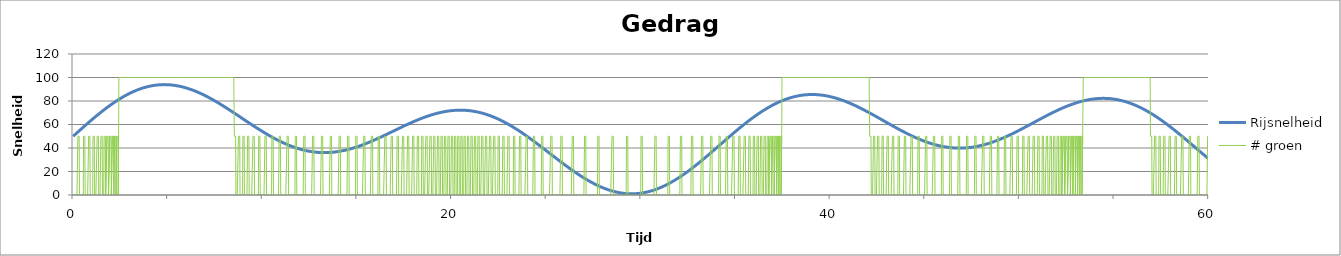
| Category | Rijsnelheid | # groen |
|---|---|---|
| 0.0 | 50 | 0 |
| 0.0 | 50.241 | 0 |
| 0.0 | 50.483 | 0 |
| 0.0 | 50.724 | 0 |
| 0.0 | 50.966 | 0 |
| 0.0 | 51.207 | 0 |
| 0.0 | 51.448 | 0 |
| 0.0 | 51.689 | 0 |
| 0.0 | 51.931 | 0 |
| 0.0 | 52.172 | 0 |
| 0.0 | 52.413 | 0 |
| 0.0 | 52.654 | 0 |
| 0.0 | 52.895 | 0 |
| 0.0 | 53.136 | 0 |
| 0.0 | 53.376 | 0 |
| 0.0 | 53.617 | 50 |
| 0.0 | 53.857 | 50 |
| 0.0 | 54.098 | 50 |
| 0.0 | 54.338 | 50 |
| 0.0 | 54.578 | 50 |
| 0.0 | 54.818 | 0 |
| 0.0 | 55.058 | 0 |
| 0.0 | 55.298 | 0 |
| 0.0 | 55.537 | 0 |
| 0.0 | 55.777 | 0 |
| 0.0 | 56.016 | 0 |
| 0.0 | 56.255 | 0 |
| 0.0 | 56.493 | 0 |
| 0.0 | 56.732 | 0 |
| 0.0 | 56.97 | 0 |
| 0.0 | 57.209 | 0 |
| 0.0 | 57.447 | 0 |
| 0.0 | 57.684 | 0 |
| 0.0 | 57.922 | 50 |
| 0.0 | 58.159 | 50 |
| 0.0 | 58.396 | 50 |
| 0.0 | 58.633 | 50 |
| 0.0 | 58.869 | 50 |
| 0.0 | 59.105 | 0 |
| 0.0 | 59.341 | 0 |
| 0.0 | 59.577 | 0 |
| 0.0 | 59.812 | 0 |
| 0.0 | 60.047 | 0 |
| 0.0 | 60.282 | 0 |
| 0.0 | 60.516 | 0 |
| 0.0 | 60.75 | 0 |
| 0.0 | 60.984 | 0 |
| 0.0 | 61.217 | 0 |
| 0.0 | 61.45 | 0 |
| 0.0 | 61.683 | 50 |
| 0.0 | 61.915 | 50 |
| 0.0 | 62.147 | 50 |
| 0.0 | 62.379 | 50 |
| 0.0 | 62.61 | 50 |
| 0.0 | 62.841 | 0 |
| 0.0 | 63.071 | 0 |
| 0.0 | 63.301 | 0 |
| 0.0 | 63.531 | 0 |
| 0.0 | 63.76 | 0 |
| 0.0 | 63.989 | 0 |
| 1.0 | 64.217 | 0 |
| 1.0 | 64.445 | 0 |
| 1.0 | 64.673 | 0 |
| 1.0 | 64.9 | 50 |
| 1.0 | 65.126 | 50 |
| 1.0 | 65.352 | 50 |
| 1.0 | 65.578 | 50 |
| 1.0 | 65.803 | 50 |
| 1.0 | 66.028 | 0 |
| 1.0 | 66.252 | 0 |
| 1.0 | 66.475 | 0 |
| 1.0 | 66.698 | 0 |
| 1.0 | 66.921 | 0 |
| 1.0 | 67.143 | 0 |
| 1.0 | 67.365 | 0 |
| 1.0 | 67.586 | 0 |
| 1.0 | 67.806 | 50 |
| 1.0 | 68.026 | 50 |
| 1.0 | 68.246 | 50 |
| 1.0 | 68.464 | 50 |
| 1.0 | 68.683 | 50 |
| 1.0 | 68.9 | 0 |
| 1.0 | 69.117 | 0 |
| 1.0 | 69.334 | 0 |
| 1.0 | 69.55 | 0 |
| 1.0 | 69.765 | 0 |
| 1.0 | 69.98 | 0 |
| 1.0 | 70.194 | 0 |
| 1.0 | 70.407 | 50 |
| 1.0 | 70.62 | 50 |
| 1.0 | 70.833 | 50 |
| 1.0 | 71.044 | 50 |
| 1.0 | 71.255 | 50 |
| 1.0 | 71.465 | 0 |
| 1.0 | 71.675 | 0 |
| 1.0 | 71.884 | 0 |
| 1.0 | 72.092 | 0 |
| 1.0 | 72.3 | 0 |
| 1.0 | 72.507 | 50 |
| 1.0 | 72.713 | 50 |
| 1.0 | 72.918 | 50 |
| 1.0 | 73.123 | 50 |
| 1.0 | 73.327 | 50 |
| 1.0 | 73.531 | 0 |
| 1.0 | 73.734 | 0 |
| 1.0 | 73.935 | 0 |
| 1.0 | 74.137 | 0 |
| 1.0 | 74.337 | 50 |
| 1.0 | 74.537 | 50 |
| 1.0 | 74.736 | 50 |
| 1.0 | 74.934 | 50 |
| 1.0 | 75.132 | 50 |
| 1.0 | 75.328 | 0 |
| 1.0 | 75.524 | 0 |
| 1.0 | 75.719 | 0 |
| 1.0 | 75.914 | 0 |
| 1.0 | 76.107 | 50 |
| 1.0 | 76.3 | 50 |
| 1.0 | 76.492 | 50 |
| 1.0 | 76.683 | 50 |
| 2.0 | 76.874 | 50 |
| 2.0 | 77.063 | 0 |
| 2.0 | 77.252 | 0 |
| 2.0 | 77.44 | 0 |
| 2.0 | 77.627 | 50 |
| 2.0 | 77.813 | 50 |
| 2.0 | 77.998 | 50 |
| 2.0 | 78.183 | 50 |
| 2.0 | 78.366 | 50 |
| 2.0 | 78.549 | 0 |
| 2.0 | 78.731 | 0 |
| 2.0 | 78.912 | 50 |
| 2.0 | 79.092 | 50 |
| 2.0 | 79.272 | 50 |
| 2.0 | 79.45 | 50 |
| 2.0 | 79.627 | 50 |
| 2.0 | 79.804 | 0 |
| 2.0 | 79.98 | 0 |
| 2.0 | 80.154 | 50 |
| 2.0 | 80.328 | 50 |
| 2.0 | 80.501 | 50 |
| 2.0 | 80.673 | 50 |
| 2.0 | 80.844 | 50 |
| 2.0 | 81.014 | 0 |
| 2.0 | 81.183 | 50 |
| 2.0 | 81.352 | 100 |
| 2.0 | 81.519 | 100 |
| 2.0 | 81.685 | 100 |
| 2.0 | 81.851 | 100 |
| 2.0 | 82.015 | 100 |
| 2.0 | 82.179 | 100 |
| 2.0 | 82.341 | 100 |
| 2.0 | 82.502 | 100 |
| 2.0 | 82.663 | 100 |
| 2.0 | 82.822 | 100 |
| 2.0 | 82.981 | 100 |
| 2.0 | 83.139 | 100 |
| 2.0 | 83.295 | 100 |
| 2.0 | 83.451 | 100 |
| 2.0 | 83.605 | 100 |
| 2.0 | 83.759 | 100 |
| 2.0 | 83.911 | 100 |
| 2.0 | 84.062 | 100 |
| 2.0 | 84.213 | 100 |
| 2.0 | 84.362 | 100 |
| 2.0 | 84.511 | 100 |
| 2.0 | 84.658 | 100 |
| 2.0 | 84.804 | 100 |
| 2.0 | 84.949 | 100 |
| 2.0 | 85.094 | 100 |
| 2.0 | 85.237 | 100 |
| 2.0 | 85.379 | 100 |
| 2.0 | 85.52 | 100 |
| 2.0 | 85.66 | 100 |
| 2.0 | 85.798 | 100 |
| 2.0 | 85.936 | 100 |
| 2.0 | 86.073 | 100 |
| 2.0 | 86.209 | 100 |
| 2.0 | 86.343 | 100 |
| 2.0 | 86.476 | 100 |
| 3.0 | 86.609 | 100 |
| 3.0 | 86.74 | 100 |
| 3.0 | 86.87 | 100 |
| 3.0 | 86.999 | 100 |
| 3.0 | 87.127 | 100 |
| 3.0 | 87.254 | 100 |
| 3.0 | 87.38 | 100 |
| 3.0 | 87.504 | 100 |
| 3.0 | 87.628 | 100 |
| 3.0 | 87.75 | 100 |
| 3.0 | 87.871 | 100 |
| 3.0 | 87.991 | 100 |
| 3.0 | 88.11 | 100 |
| 3.0 | 88.228 | 100 |
| 3.0 | 88.345 | 100 |
| 3.0 | 88.46 | 100 |
| 3.0 | 88.575 | 100 |
| 3.0 | 88.688 | 100 |
| 3.0 | 88.8 | 100 |
| 3.0 | 88.911 | 100 |
| 3.0 | 89.021 | 100 |
| 3.0 | 89.129 | 100 |
| 3.0 | 89.237 | 100 |
| 3.0 | 89.343 | 100 |
| 3.0 | 89.448 | 100 |
| 3.0 | 89.552 | 100 |
| 3.0 | 89.655 | 100 |
| 3.0 | 89.757 | 100 |
| 3.0 | 89.857 | 100 |
| 3.0 | 89.956 | 100 |
| 3.0 | 90.054 | 100 |
| 3.0 | 90.151 | 100 |
| 3.0 | 90.247 | 100 |
| 3.0 | 90.341 | 100 |
| 3.0 | 90.435 | 100 |
| 3.0 | 90.527 | 100 |
| 3.0 | 90.618 | 100 |
| 3.0 | 90.707 | 100 |
| 3.0 | 90.796 | 100 |
| 3.0 | 90.883 | 100 |
| 3.0 | 90.969 | 100 |
| 3.0 | 91.054 | 100 |
| 3.0 | 91.138 | 100 |
| 3.0 | 91.22 | 100 |
| 3.0 | 91.302 | 100 |
| 3.0 | 91.382 | 100 |
| 3.0 | 91.461 | 100 |
| 3.0 | 91.538 | 100 |
| 3.0 | 91.615 | 100 |
| 3.0 | 91.69 | 100 |
| 3.0 | 91.764 | 100 |
| 3.0 | 91.837 | 100 |
| 3.0 | 91.908 | 100 |
| 3.0 | 91.979 | 100 |
| 3.0 | 92.048 | 100 |
| 3.0 | 92.116 | 100 |
| 3.0 | 92.182 | 100 |
| 3.0 | 92.248 | 100 |
| 3.0 | 92.312 | 100 |
| 3.0 | 92.375 | 100 |
| 4.0 | 92.436 | 100 |
| 4.0 | 92.497 | 100 |
| 4.0 | 92.556 | 100 |
| 4.0 | 92.614 | 100 |
| 4.0 | 92.671 | 100 |
| 4.0 | 92.726 | 100 |
| 4.0 | 92.781 | 100 |
| 4.0 | 92.834 | 100 |
| 4.0 | 92.886 | 100 |
| 4.0 | 92.936 | 100 |
| 4.0 | 92.985 | 100 |
| 4.0 | 93.034 | 100 |
| 4.0 | 93.08 | 100 |
| 4.0 | 93.126 | 100 |
| 4.0 | 93.17 | 100 |
| 4.0 | 93.213 | 100 |
| 4.0 | 93.255 | 100 |
| 4.0 | 93.296 | 100 |
| 4.0 | 93.335 | 100 |
| 4.0 | 93.374 | 100 |
| 4.0 | 93.41 | 100 |
| 4.0 | 93.446 | 100 |
| 4.0 | 93.48 | 100 |
| 4.0 | 93.514 | 100 |
| 4.0 | 93.546 | 100 |
| 4.0 | 93.576 | 100 |
| 4.0 | 93.606 | 100 |
| 4.0 | 93.634 | 100 |
| 4.0 | 93.661 | 100 |
| 4.0 | 93.686 | 100 |
| 4.0 | 93.711 | 100 |
| 4.0 | 93.734 | 100 |
| 4.0 | 93.756 | 100 |
| 4.0 | 93.777 | 100 |
| 4.0 | 93.796 | 100 |
| 4.0 | 93.814 | 100 |
| 4.0 | 93.831 | 100 |
| 4.0 | 93.847 | 100 |
| 4.0 | 93.862 | 100 |
| 4.0 | 93.875 | 100 |
| 4.0 | 93.887 | 100 |
| 4.0 | 93.898 | 100 |
| 4.0 | 93.907 | 100 |
| 4.0 | 93.915 | 100 |
| 4.0 | 93.922 | 100 |
| 4.0 | 93.928 | 100 |
| 4.0 | 93.933 | 100 |
| 4.0 | 93.936 | 100 |
| 4.0 | 93.938 | 100 |
| 4.0 | 93.939 | 100 |
| 4.0 | 93.939 | 100 |
| 4.0 | 93.937 | 100 |
| 4.0 | 93.935 | 100 |
| 4.0 | 93.931 | 100 |
| 4.0 | 93.925 | 100 |
| 4.0 | 93.919 | 100 |
| 4.0 | 93.911 | 100 |
| 4.0 | 93.902 | 100 |
| 4.0 | 93.892 | 100 |
| 4.0 | 93.881 | 100 |
| 5.0 | 93.868 | 100 |
| 5.0 | 93.854 | 100 |
| 5.0 | 93.839 | 100 |
| 5.0 | 93.823 | 100 |
| 5.0 | 93.806 | 100 |
| 5.0 | 93.787 | 100 |
| 5.0 | 93.767 | 100 |
| 5.0 | 93.746 | 100 |
| 5.0 | 93.724 | 100 |
| 5.0 | 93.701 | 100 |
| 5.0 | 93.676 | 100 |
| 5.0 | 93.65 | 100 |
| 5.0 | 93.623 | 100 |
| 5.0 | 93.595 | 100 |
| 5.0 | 93.565 | 100 |
| 5.0 | 93.535 | 100 |
| 5.0 | 93.503 | 100 |
| 5.0 | 93.47 | 100 |
| 5.0 | 93.436 | 100 |
| 5.0 | 93.401 | 100 |
| 5.0 | 93.364 | 100 |
| 5.0 | 93.326 | 100 |
| 5.0 | 93.288 | 100 |
| 5.0 | 93.248 | 100 |
| 5.0 | 93.206 | 100 |
| 5.0 | 93.164 | 100 |
| 5.0 | 93.12 | 100 |
| 5.0 | 93.076 | 100 |
| 5.0 | 93.03 | 100 |
| 5.0 | 92.983 | 100 |
| 5.0 | 92.935 | 100 |
| 5.0 | 92.886 | 100 |
| 5.0 | 92.835 | 100 |
| 5.0 | 92.784 | 100 |
| 5.0 | 92.731 | 100 |
| 5.0 | 92.677 | 100 |
| 5.0 | 92.622 | 100 |
| 5.0 | 92.566 | 100 |
| 5.0 | 92.509 | 100 |
| 5.0 | 92.45 | 100 |
| 5.0 | 92.391 | 100 |
| 5.0 | 92.33 | 100 |
| 5.0 | 92.268 | 100 |
| 5.0 | 92.206 | 100 |
| 5.0 | 92.142 | 100 |
| 5.0 | 92.077 | 100 |
| 5.0 | 92.011 | 100 |
| 5.0 | 91.943 | 100 |
| 5.0 | 91.875 | 100 |
| 5.0 | 91.806 | 100 |
| 5.0 | 91.735 | 100 |
| 5.0 | 91.664 | 100 |
| 5.0 | 91.591 | 100 |
| 5.0 | 91.517 | 100 |
| 5.0 | 91.442 | 100 |
| 5.0 | 91.366 | 100 |
| 5.0 | 91.289 | 100 |
| 5.0 | 91.211 | 100 |
| 5.0 | 91.132 | 100 |
| 5.0 | 91.052 | 100 |
| 6.0 | 90.971 | 100 |
| 6.0 | 90.889 | 100 |
| 6.0 | 90.806 | 100 |
| 6.0 | 90.721 | 100 |
| 6.0 | 90.636 | 100 |
| 6.0 | 90.55 | 100 |
| 6.0 | 90.462 | 100 |
| 6.0 | 90.374 | 100 |
| 6.0 | 90.285 | 100 |
| 6.0 | 90.194 | 100 |
| 6.0 | 90.103 | 100 |
| 6.0 | 90.01 | 100 |
| 6.0 | 89.917 | 100 |
| 6.0 | 89.822 | 100 |
| 6.0 | 89.727 | 100 |
| 6.0 | 89.631 | 100 |
| 6.0 | 89.533 | 100 |
| 6.0 | 89.435 | 100 |
| 6.0 | 89.335 | 100 |
| 6.0 | 89.235 | 100 |
| 6.0 | 89.134 | 100 |
| 6.0 | 89.032 | 100 |
| 6.0 | 88.929 | 100 |
| 6.0 | 88.824 | 100 |
| 6.0 | 88.719 | 100 |
| 6.0 | 88.613 | 100 |
| 6.0 | 88.506 | 100 |
| 6.0 | 88.399 | 100 |
| 6.0 | 88.29 | 100 |
| 6.0 | 88.18 | 100 |
| 6.0 | 88.069 | 100 |
| 6.0 | 87.958 | 100 |
| 6.0 | 87.845 | 100 |
| 6.0 | 87.732 | 100 |
| 6.0 | 87.618 | 100 |
| 6.0 | 87.503 | 100 |
| 6.0 | 87.387 | 100 |
| 6.0 | 87.27 | 100 |
| 6.0 | 87.152 | 100 |
| 6.0 | 87.033 | 100 |
| 6.0 | 86.914 | 100 |
| 6.0 | 86.794 | 100 |
| 6.0 | 86.672 | 100 |
| 6.0 | 86.55 | 100 |
| 6.0 | 86.427 | 100 |
| 6.0 | 86.304 | 100 |
| 6.0 | 86.179 | 100 |
| 6.0 | 86.054 | 100 |
| 6.0 | 85.927 | 100 |
| 6.0 | 85.8 | 100 |
| 6.0 | 85.673 | 100 |
| 6.0 | 85.544 | 100 |
| 6.0 | 85.414 | 100 |
| 6.0 | 85.284 | 100 |
| 6.0 | 85.153 | 100 |
| 6.0 | 85.021 | 100 |
| 6.0 | 84.889 | 100 |
| 6.0 | 84.755 | 100 |
| 6.0 | 84.621 | 100 |
| 6.0 | 84.486 | 100 |
| 7.0 | 84.351 | 100 |
| 7.0 | 84.214 | 100 |
| 7.0 | 84.077 | 100 |
| 7.0 | 83.939 | 100 |
| 7.0 | 83.801 | 100 |
| 7.0 | 83.661 | 100 |
| 7.0 | 83.521 | 100 |
| 7.0 | 83.381 | 100 |
| 7.0 | 83.239 | 100 |
| 7.0 | 83.097 | 100 |
| 7.0 | 82.954 | 100 |
| 7.0 | 82.811 | 100 |
| 7.0 | 82.666 | 100 |
| 7.0 | 82.522 | 100 |
| 7.0 | 82.376 | 100 |
| 7.0 | 82.23 | 100 |
| 7.0 | 82.083 | 100 |
| 7.0 | 81.935 | 100 |
| 7.0 | 81.787 | 100 |
| 7.0 | 81.638 | 100 |
| 7.0 | 81.489 | 100 |
| 7.0 | 81.339 | 100 |
| 7.0 | 81.188 | 100 |
| 7.0 | 81.037 | 100 |
| 7.0 | 80.885 | 100 |
| 7.0 | 80.732 | 100 |
| 7.0 | 80.579 | 100 |
| 7.0 | 80.425 | 100 |
| 7.0 | 80.271 | 100 |
| 7.0 | 80.116 | 100 |
| 7.0 | 79.961 | 100 |
| 7.0 | 79.805 | 100 |
| 7.0 | 79.648 | 100 |
| 7.0 | 79.491 | 100 |
| 7.0 | 79.333 | 100 |
| 7.0 | 79.175 | 100 |
| 7.0 | 79.016 | 100 |
| 7.0 | 78.857 | 100 |
| 7.0 | 78.697 | 100 |
| 7.0 | 78.537 | 100 |
| 7.0 | 78.376 | 100 |
| 7.0 | 78.215 | 100 |
| 7.0 | 78.053 | 100 |
| 7.0 | 77.891 | 100 |
| 7.0 | 77.728 | 100 |
| 7.0 | 77.565 | 100 |
| 7.0 | 77.401 | 100 |
| 7.0 | 77.237 | 100 |
| 7.0 | 77.072 | 100 |
| 7.0 | 76.907 | 100 |
| 7.0 | 76.741 | 100 |
| 7.0 | 76.575 | 100 |
| 7.0 | 76.409 | 100 |
| 7.0 | 76.242 | 100 |
| 7.0 | 76.075 | 100 |
| 7.0 | 75.908 | 100 |
| 7.0 | 75.74 | 100 |
| 7.0 | 75.571 | 100 |
| 7.0 | 75.402 | 100 |
| 7.0 | 75.233 | 100 |
| 8.0 | 75.064 | 100 |
| 8.0 | 74.894 | 100 |
| 8.0 | 74.723 | 100 |
| 8.0 | 74.553 | 100 |
| 8.0 | 74.382 | 100 |
| 8.0 | 74.211 | 100 |
| 8.0 | 74.039 | 100 |
| 8.0 | 73.867 | 100 |
| 8.0 | 73.695 | 100 |
| 8.0 | 73.522 | 100 |
| 8.0 | 73.349 | 100 |
| 8.0 | 73.176 | 100 |
| 8.0 | 73.002 | 100 |
| 8.0 | 72.829 | 100 |
| 8.0 | 72.655 | 100 |
| 8.0 | 72.48 | 100 |
| 8.0 | 72.306 | 100 |
| 8.0 | 72.131 | 100 |
| 8.0 | 71.956 | 100 |
| 8.0 | 71.781 | 100 |
| 8.0 | 71.605 | 100 |
| 8.0 | 71.429 | 100 |
| 8.0 | 71.253 | 100 |
| 8.0 | 71.077 | 100 |
| 8.0 | 70.901 | 100 |
| 8.0 | 70.724 | 100 |
| 8.0 | 70.547 | 100 |
| 8.0 | 70.37 | 100 |
| 8.0 | 70.193 | 100 |
| 8.0 | 70.016 | 100 |
| 8.0 | 69.838 | 100 |
| 8.0 | 69.66 | 50 |
| 8.0 | 69.482 | 50 |
| 8.0 | 69.304 | 50 |
| 8.0 | 69.126 | 50 |
| 8.0 | 68.948 | 50 |
| 8.0 | 68.77 | 0 |
| 8.0 | 68.591 | 0 |
| 8.0 | 68.413 | 0 |
| 8.0 | 68.234 | 0 |
| 8.0 | 68.055 | 0 |
| 8.0 | 67.876 | 0 |
| 8.0 | 67.697 | 0 |
| 8.0 | 67.518 | 0 |
| 8.0 | 67.339 | 50 |
| 8.0 | 67.16 | 50 |
| 8.0 | 66.981 | 50 |
| 8.0 | 66.801 | 50 |
| 8.0 | 66.622 | 50 |
| 8.0 | 66.443 | 0 |
| 8.0 | 66.263 | 0 |
| 8.0 | 66.084 | 0 |
| 8.0 | 65.904 | 0 |
| 8.0 | 65.725 | 0 |
| 8.0 | 65.546 | 0 |
| 8.0 | 65.366 | 0 |
| 8.0 | 65.187 | 0 |
| 8.0 | 65.007 | 0 |
| 8.0 | 64.828 | 50 |
| 8.0 | 64.649 | 50 |
| 9.0 | 64.469 | 50 |
| 9.0 | 64.29 | 50 |
| 9.0 | 64.111 | 50 |
| 9.0 | 63.932 | 0 |
| 9.0 | 63.753 | 0 |
| 9.0 | 63.574 | 0 |
| 9.0 | 63.395 | 0 |
| 9.0 | 63.216 | 0 |
| 9.0 | 63.038 | 0 |
| 9.0 | 62.859 | 0 |
| 9.0 | 62.681 | 0 |
| 9.0 | 62.502 | 0 |
| 9.0 | 62.324 | 0 |
| 9.0 | 62.146 | 50 |
| 9.0 | 61.968 | 50 |
| 9.0 | 61.79 | 50 |
| 9.0 | 61.612 | 50 |
| 9.0 | 61.435 | 50 |
| 9.0 | 61.258 | 0 |
| 9.0 | 61.08 | 0 |
| 9.0 | 60.903 | 0 |
| 9.0 | 60.727 | 0 |
| 9.0 | 60.55 | 0 |
| 9.0 | 60.374 | 0 |
| 9.0 | 60.197 | 0 |
| 9.0 | 60.021 | 0 |
| 9.0 | 59.846 | 0 |
| 9.0 | 59.67 | 0 |
| 9.0 | 59.495 | 0 |
| 9.0 | 59.32 | 0 |
| 9.0 | 59.145 | 50 |
| 9.0 | 58.97 | 50 |
| 9.0 | 58.796 | 50 |
| 9.0 | 58.622 | 50 |
| 9.0 | 58.448 | 50 |
| 9.0 | 58.274 | 0 |
| 9.0 | 58.101 | 0 |
| 9.0 | 57.928 | 0 |
| 9.0 | 57.756 | 0 |
| 9.0 | 57.583 | 0 |
| 9.0 | 57.411 | 0 |
| 9.0 | 57.239 | 0 |
| 9.0 | 57.068 | 0 |
| 9.0 | 56.897 | 0 |
| 9.0 | 56.726 | 0 |
| 9.0 | 56.556 | 0 |
| 9.0 | 56.386 | 0 |
| 9.0 | 56.216 | 0 |
| 9.0 | 56.047 | 50 |
| 9.0 | 55.878 | 50 |
| 9.0 | 55.709 | 50 |
| 9.0 | 55.541 | 50 |
| 9.0 | 55.373 | 50 |
| 9.0 | 55.206 | 0 |
| 9.0 | 55.039 | 0 |
| 9.0 | 54.872 | 0 |
| 9.0 | 54.706 | 0 |
| 9.0 | 54.54 | 0 |
| 9.0 | 54.375 | 0 |
| 9.0 | 54.21 | 0 |
| 10.0 | 54.045 | 0 |
| 10.0 | 53.881 | 0 |
| 10.0 | 53.717 | 0 |
| 10.0 | 53.554 | 0 |
| 10.0 | 53.391 | 0 |
| 10.0 | 53.229 | 0 |
| 10.0 | 53.067 | 0 |
| 10.0 | 52.906 | 0 |
| 10.0 | 52.745 | 50 |
| 10.0 | 52.585 | 50 |
| 10.0 | 52.425 | 50 |
| 10.0 | 52.266 | 50 |
| 10.0 | 52.107 | 50 |
| 10.0 | 51.948 | 0 |
| 10.0 | 51.791 | 0 |
| 10.0 | 51.633 | 0 |
| 10.0 | 51.477 | 0 |
| 10.0 | 51.32 | 0 |
| 10.0 | 51.165 | 0 |
| 10.0 | 51.009 | 0 |
| 10.0 | 50.855 | 0 |
| 10.0 | 50.701 | 0 |
| 10.0 | 50.547 | 0 |
| 10.0 | 50.394 | 0 |
| 10.0 | 50.242 | 0 |
| 10.0 | 50.09 | 0 |
| 10.0 | 49.939 | 0 |
| 10.0 | 49.788 | 0 |
| 10.0 | 49.638 | 0 |
| 10.0 | 49.489 | 0 |
| 10.0 | 49.34 | 50 |
| 10.0 | 49.192 | 50 |
| 10.0 | 49.044 | 50 |
| 10.0 | 48.898 | 50 |
| 10.0 | 48.751 | 50 |
| 10.0 | 48.606 | 0 |
| 10.0 | 48.46 | 0 |
| 10.0 | 48.316 | 0 |
| 10.0 | 48.172 | 0 |
| 10.0 | 48.029 | 0 |
| 10.0 | 47.887 | 0 |
| 10.0 | 47.745 | 0 |
| 10.0 | 47.604 | 0 |
| 10.0 | 47.463 | 0 |
| 10.0 | 47.323 | 0 |
| 10.0 | 47.184 | 0 |
| 10.0 | 47.046 | 0 |
| 10.0 | 46.908 | 0 |
| 10.0 | 46.771 | 0 |
| 10.0 | 46.635 | 0 |
| 10.0 | 46.499 | 0 |
| 10.0 | 46.364 | 0 |
| 10.0 | 46.23 | 0 |
| 10.0 | 46.097 | 50 |
| 10.0 | 45.964 | 50 |
| 10.0 | 45.832 | 50 |
| 10.0 | 45.701 | 50 |
| 10.0 | 45.57 | 50 |
| 10.0 | 45.44 | 0 |
| 10.0 | 45.311 | 0 |
| 11.0 | 45.183 | 0 |
| 11.0 | 45.055 | 0 |
| 11.0 | 44.928 | 0 |
| 11.0 | 44.802 | 0 |
| 11.0 | 44.677 | 0 |
| 11.0 | 44.553 | 0 |
| 11.0 | 44.429 | 0 |
| 11.0 | 44.306 | 0 |
| 11.0 | 44.184 | 0 |
| 11.0 | 44.062 | 0 |
| 11.0 | 43.942 | 0 |
| 11.0 | 43.822 | 0 |
| 11.0 | 43.703 | 0 |
| 11.0 | 43.585 | 0 |
| 11.0 | 43.468 | 0 |
| 11.0 | 43.351 | 0 |
| 11.0 | 43.235 | 0 |
| 11.0 | 43.12 | 0 |
| 11.0 | 43.006 | 50 |
| 11.0 | 42.893 | 50 |
| 11.0 | 42.781 | 50 |
| 11.0 | 42.669 | 50 |
| 11.0 | 42.558 | 50 |
| 11.0 | 42.448 | 0 |
| 11.0 | 42.339 | 0 |
| 11.0 | 42.231 | 0 |
| 11.0 | 42.124 | 0 |
| 11.0 | 42.017 | 0 |
| 11.0 | 41.912 | 0 |
| 11.0 | 41.807 | 0 |
| 11.0 | 41.703 | 0 |
| 11.0 | 41.6 | 0 |
| 11.0 | 41.498 | 0 |
| 11.0 | 41.396 | 0 |
| 11.0 | 41.296 | 0 |
| 11.0 | 41.196 | 0 |
| 11.0 | 41.098 | 0 |
| 11.0 | 41 | 0 |
| 11.0 | 40.903 | 0 |
| 11.0 | 40.807 | 0 |
| 11.0 | 40.712 | 0 |
| 11.0 | 40.618 | 0 |
| 11.0 | 40.525 | 0 |
| 11.0 | 40.432 | 0 |
| 11.0 | 40.341 | 50 |
| 11.0 | 40.25 | 50 |
| 11.0 | 40.161 | 50 |
| 11.0 | 40.072 | 50 |
| 11.0 | 39.984 | 50 |
| 11.0 | 39.897 | 0 |
| 11.0 | 39.812 | 0 |
| 11.0 | 39.727 | 0 |
| 11.0 | 39.642 | 0 |
| 11.0 | 39.559 | 0 |
| 11.0 | 39.477 | 0 |
| 11.0 | 39.396 | 0 |
| 11.0 | 39.316 | 0 |
| 11.0 | 39.236 | 0 |
| 11.0 | 39.158 | 0 |
| 11.0 | 39.08 | 0 |
| 12.0 | 39.004 | 0 |
| 12.0 | 38.928 | 0 |
| 12.0 | 38.854 | 0 |
| 12.0 | 38.78 | 0 |
| 12.0 | 38.707 | 0 |
| 12.0 | 38.635 | 0 |
| 12.0 | 38.565 | 0 |
| 12.0 | 38.495 | 0 |
| 12.0 | 38.426 | 0 |
| 12.0 | 38.358 | 0 |
| 12.0 | 38.291 | 0 |
| 12.0 | 38.225 | 50 |
| 12.0 | 38.16 | 50 |
| 12.0 | 38.096 | 50 |
| 12.0 | 38.033 | 50 |
| 12.0 | 37.971 | 50 |
| 12.0 | 37.91 | 0 |
| 12.0 | 37.85 | 0 |
| 12.0 | 37.791 | 0 |
| 12.0 | 37.733 | 0 |
| 12.0 | 37.676 | 0 |
| 12.0 | 37.619 | 0 |
| 12.0 | 37.564 | 0 |
| 12.0 | 37.51 | 0 |
| 12.0 | 37.457 | 0 |
| 12.0 | 37.405 | 0 |
| 12.0 | 37.353 | 0 |
| 12.0 | 37.303 | 0 |
| 12.0 | 37.254 | 0 |
| 12.0 | 37.206 | 0 |
| 12.0 | 37.159 | 0 |
| 12.0 | 37.112 | 0 |
| 12.0 | 37.067 | 0 |
| 12.0 | 37.023 | 0 |
| 12.0 | 36.98 | 0 |
| 12.0 | 36.937 | 0 |
| 12.0 | 36.896 | 0 |
| 12.0 | 36.856 | 0 |
| 12.0 | 36.817 | 0 |
| 12.0 | 36.778 | 50 |
| 12.0 | 36.741 | 50 |
| 12.0 | 36.705 | 50 |
| 12.0 | 36.67 | 50 |
| 12.0 | 36.636 | 50 |
| 12.0 | 36.602 | 0 |
| 12.0 | 36.57 | 0 |
| 12.0 | 36.539 | 0 |
| 12.0 | 36.509 | 0 |
| 12.0 | 36.48 | 0 |
| 12.0 | 36.451 | 0 |
| 12.0 | 36.424 | 0 |
| 12.0 | 36.398 | 0 |
| 12.0 | 36.373 | 0 |
| 12.0 | 36.349 | 0 |
| 12.0 | 36.326 | 0 |
| 12.0 | 36.304 | 0 |
| 12.0 | 36.282 | 0 |
| 12.0 | 36.262 | 0 |
| 12.0 | 36.243 | 0 |
| 12.0 | 36.225 | 0 |
| 13.0 | 36.208 | 0 |
| 13.0 | 36.192 | 0 |
| 13.0 | 36.177 | 0 |
| 13.0 | 36.163 | 0 |
| 13.0 | 36.15 | 0 |
| 13.0 | 36.137 | 0 |
| 13.0 | 36.126 | 0 |
| 13.0 | 36.116 | 50 |
| 13.0 | 36.107 | 50 |
| 13.0 | 36.099 | 50 |
| 13.0 | 36.092 | 50 |
| 13.0 | 36.086 | 50 |
| 13.0 | 36.081 | 0 |
| 13.0 | 36.077 | 0 |
| 13.0 | 36.074 | 0 |
| 13.0 | 36.072 | 0 |
| 13.0 | 36.07 | 0 |
| 13.0 | 36.07 | 0 |
| 13.0 | 36.071 | 0 |
| 13.0 | 36.073 | 0 |
| 13.0 | 36.076 | 0 |
| 13.0 | 36.08 | 0 |
| 13.0 | 36.085 | 0 |
| 13.0 | 36.09 | 0 |
| 13.0 | 36.097 | 0 |
| 13.0 | 36.105 | 0 |
| 13.0 | 36.114 | 0 |
| 13.0 | 36.124 | 0 |
| 13.0 | 36.134 | 0 |
| 13.0 | 36.146 | 0 |
| 13.0 | 36.159 | 0 |
| 13.0 | 36.172 | 0 |
| 13.0 | 36.187 | 0 |
| 13.0 | 36.203 | 0 |
| 13.0 | 36.219 | 0 |
| 13.0 | 36.237 | 50 |
| 13.0 | 36.255 | 50 |
| 13.0 | 36.275 | 50 |
| 13.0 | 36.295 | 50 |
| 13.0 | 36.317 | 50 |
| 13.0 | 36.339 | 0 |
| 13.0 | 36.362 | 0 |
| 13.0 | 36.386 | 0 |
| 13.0 | 36.412 | 0 |
| 13.0 | 36.438 | 0 |
| 13.0 | 36.465 | 0 |
| 13.0 | 36.493 | 0 |
| 13.0 | 36.522 | 0 |
| 13.0 | 36.552 | 0 |
| 13.0 | 36.583 | 0 |
| 13.0 | 36.615 | 0 |
| 13.0 | 36.647 | 0 |
| 13.0 | 36.681 | 0 |
| 13.0 | 36.716 | 0 |
| 13.0 | 36.751 | 0 |
| 13.0 | 36.788 | 0 |
| 13.0 | 36.825 | 0 |
| 13.0 | 36.863 | 0 |
| 13.0 | 36.903 | 0 |
| 13.0 | 36.943 | 0 |
| 14.0 | 36.984 | 0 |
| 14.0 | 37.026 | 0 |
| 14.0 | 37.069 | 0 |
| 14.0 | 37.112 | 50 |
| 14.0 | 37.157 | 50 |
| 14.0 | 37.203 | 50 |
| 14.0 | 37.249 | 50 |
| 14.0 | 37.297 | 50 |
| 14.0 | 37.345 | 0 |
| 14.0 | 37.394 | 0 |
| 14.0 | 37.444 | 0 |
| 14.0 | 37.495 | 0 |
| 14.0 | 37.546 | 0 |
| 14.0 | 37.599 | 0 |
| 14.0 | 37.653 | 0 |
| 14.0 | 37.707 | 0 |
| 14.0 | 37.762 | 0 |
| 14.0 | 37.818 | 0 |
| 14.0 | 37.875 | 0 |
| 14.0 | 37.933 | 0 |
| 14.0 | 37.992 | 0 |
| 14.0 | 38.051 | 0 |
| 14.0 | 38.111 | 0 |
| 14.0 | 38.173 | 0 |
| 14.0 | 38.235 | 0 |
| 14.0 | 38.297 | 0 |
| 14.0 | 38.361 | 0 |
| 14.0 | 38.426 | 0 |
| 14.0 | 38.491 | 0 |
| 14.0 | 38.557 | 0 |
| 14.0 | 38.624 | 50 |
| 14.0 | 38.692 | 50 |
| 14.0 | 38.76 | 50 |
| 14.0 | 38.829 | 50 |
| 14.0 | 38.9 | 50 |
| 14.0 | 38.971 | 0 |
| 14.0 | 39.042 | 0 |
| 14.0 | 39.115 | 0 |
| 14.0 | 39.188 | 0 |
| 14.0 | 39.262 | 0 |
| 14.0 | 39.337 | 0 |
| 14.0 | 39.412 | 0 |
| 14.0 | 39.489 | 0 |
| 14.0 | 39.566 | 0 |
| 14.0 | 39.644 | 0 |
| 14.0 | 39.722 | 0 |
| 14.0 | 39.802 | 0 |
| 14.0 | 39.882 | 0 |
| 14.0 | 39.963 | 0 |
| 14.0 | 40.044 | 0 |
| 14.0 | 40.127 | 0 |
| 14.0 | 40.21 | 0 |
| 14.0 | 40.293 | 0 |
| 14.0 | 40.378 | 0 |
| 14.0 | 40.463 | 0 |
| 14.0 | 40.549 | 0 |
| 14.0 | 40.635 | 50 |
| 14.0 | 40.723 | 50 |
| 14.0 | 40.811 | 50 |
| 14.0 | 40.899 | 50 |
| 15.0 | 40.989 | 50 |
| 15.0 | 41.079 | 0 |
| 15.0 | 41.169 | 0 |
| 15.0 | 41.261 | 0 |
| 15.0 | 41.353 | 0 |
| 15.0 | 41.445 | 0 |
| 15.0 | 41.539 | 0 |
| 15.0 | 41.633 | 0 |
| 15.0 | 41.727 | 0 |
| 15.0 | 41.822 | 0 |
| 15.0 | 41.918 | 0 |
| 15.0 | 42.015 | 0 |
| 15.0 | 42.112 | 0 |
| 15.0 | 42.21 | 0 |
| 15.0 | 42.308 | 0 |
| 15.0 | 42.407 | 0 |
| 15.0 | 42.507 | 0 |
| 15.0 | 42.607 | 0 |
| 15.0 | 42.708 | 0 |
| 15.0 | 42.809 | 0 |
| 15.0 | 42.911 | 0 |
| 15.0 | 43.013 | 50 |
| 15.0 | 43.116 | 50 |
| 15.0 | 43.22 | 50 |
| 15.0 | 43.324 | 50 |
| 15.0 | 43.429 | 50 |
| 15.0 | 43.534 | 0 |
| 15.0 | 43.64 | 0 |
| 15.0 | 43.747 | 0 |
| 15.0 | 43.853 | 0 |
| 15.0 | 43.961 | 0 |
| 15.0 | 44.069 | 0 |
| 15.0 | 44.177 | 0 |
| 15.0 | 44.286 | 0 |
| 15.0 | 44.396 | 0 |
| 15.0 | 44.506 | 0 |
| 15.0 | 44.616 | 0 |
| 15.0 | 44.727 | 0 |
| 15.0 | 44.839 | 0 |
| 15.0 | 44.951 | 0 |
| 15.0 | 45.063 | 0 |
| 15.0 | 45.176 | 0 |
| 15.0 | 45.289 | 0 |
| 15.0 | 45.403 | 0 |
| 15.0 | 45.517 | 0 |
| 15.0 | 45.632 | 50 |
| 15.0 | 45.747 | 50 |
| 15.0 | 45.863 | 50 |
| 15.0 | 45.979 | 50 |
| 15.0 | 46.095 | 50 |
| 15.0 | 46.212 | 0 |
| 15.0 | 46.329 | 0 |
| 15.0 | 46.446 | 0 |
| 15.0 | 46.564 | 0 |
| 15.0 | 46.683 | 0 |
| 15.0 | 46.802 | 0 |
| 15.0 | 46.921 | 0 |
| 15.0 | 47.04 | 0 |
| 15.0 | 47.16 | 0 |
| 15.0 | 47.28 | 0 |
| 16.0 | 47.401 | 0 |
| 16.0 | 47.522 | 0 |
| 16.0 | 47.643 | 0 |
| 16.0 | 47.765 | 0 |
| 16.0 | 47.886 | 0 |
| 16.0 | 48.009 | 0 |
| 16.0 | 48.131 | 0 |
| 16.0 | 48.254 | 50 |
| 16.0 | 48.377 | 50 |
| 16.0 | 48.501 | 50 |
| 16.0 | 48.624 | 50 |
| 16.0 | 48.748 | 50 |
| 16.0 | 48.873 | 0 |
| 16.0 | 48.997 | 0 |
| 16.0 | 49.122 | 0 |
| 16.0 | 49.247 | 0 |
| 16.0 | 49.373 | 0 |
| 16.0 | 49.498 | 0 |
| 16.0 | 49.624 | 0 |
| 16.0 | 49.75 | 0 |
| 16.0 | 49.876 | 0 |
| 16.0 | 50.003 | 0 |
| 16.0 | 50.13 | 0 |
| 16.0 | 50.257 | 0 |
| 16.0 | 50.384 | 0 |
| 16.0 | 50.511 | 0 |
| 16.0 | 50.639 | 0 |
| 16.0 | 50.766 | 0 |
| 16.0 | 50.894 | 50 |
| 16.0 | 51.022 | 50 |
| 16.0 | 51.15 | 50 |
| 16.0 | 51.279 | 50 |
| 16.0 | 51.407 | 50 |
| 16.0 | 51.536 | 0 |
| 16.0 | 51.665 | 0 |
| 16.0 | 51.794 | 0 |
| 16.0 | 51.923 | 0 |
| 16.0 | 52.052 | 0 |
| 16.0 | 52.181 | 0 |
| 16.0 | 52.31 | 0 |
| 16.0 | 52.44 | 0 |
| 16.0 | 52.569 | 0 |
| 16.0 | 52.699 | 0 |
| 16.0 | 52.829 | 0 |
| 16.0 | 52.959 | 0 |
| 16.0 | 53.088 | 0 |
| 16.0 | 53.218 | 0 |
| 16.0 | 53.348 | 0 |
| 16.0 | 53.478 | 50 |
| 16.0 | 53.608 | 50 |
| 16.0 | 53.738 | 50 |
| 16.0 | 53.869 | 50 |
| 16.0 | 53.999 | 50 |
| 16.0 | 54.129 | 0 |
| 16.0 | 54.259 | 0 |
| 16.0 | 54.389 | 0 |
| 16.0 | 54.519 | 0 |
| 16.0 | 54.649 | 0 |
| 16.0 | 54.779 | 0 |
| 16.0 | 54.91 | 0 |
| 17.0 | 55.04 | 0 |
| 17.0 | 55.17 | 0 |
| 17.0 | 55.3 | 0 |
| 17.0 | 55.429 | 0 |
| 17.0 | 55.559 | 0 |
| 17.0 | 55.689 | 0 |
| 17.0 | 55.819 | 0 |
| 17.0 | 55.948 | 50 |
| 17.0 | 56.078 | 50 |
| 17.0 | 56.207 | 50 |
| 17.0 | 56.337 | 50 |
| 17.0 | 56.466 | 50 |
| 17.0 | 56.595 | 0 |
| 17.0 | 56.724 | 0 |
| 17.0 | 56.853 | 0 |
| 17.0 | 56.982 | 0 |
| 17.0 | 57.11 | 0 |
| 17.0 | 57.239 | 0 |
| 17.0 | 57.367 | 0 |
| 17.0 | 57.495 | 0 |
| 17.0 | 57.623 | 0 |
| 17.0 | 57.751 | 0 |
| 17.0 | 57.879 | 0 |
| 17.0 | 58.006 | 0 |
| 17.0 | 58.133 | 50 |
| 17.0 | 58.26 | 50 |
| 17.0 | 58.387 | 50 |
| 17.0 | 58.514 | 50 |
| 17.0 | 58.64 | 50 |
| 17.0 | 58.767 | 0 |
| 17.0 | 58.893 | 0 |
| 17.0 | 59.018 | 0 |
| 17.0 | 59.144 | 0 |
| 17.0 | 59.269 | 0 |
| 17.0 | 59.394 | 0 |
| 17.0 | 59.519 | 0 |
| 17.0 | 59.643 | 0 |
| 17.0 | 59.767 | 0 |
| 17.0 | 59.891 | 0 |
| 17.0 | 60.015 | 0 |
| 17.0 | 60.138 | 50 |
| 17.0 | 60.261 | 50 |
| 17.0 | 60.384 | 50 |
| 17.0 | 60.506 | 50 |
| 17.0 | 60.628 | 50 |
| 17.0 | 60.75 | 0 |
| 17.0 | 60.872 | 0 |
| 17.0 | 60.993 | 0 |
| 17.0 | 61.114 | 0 |
| 17.0 | 61.234 | 0 |
| 17.0 | 61.354 | 0 |
| 17.0 | 61.474 | 0 |
| 17.0 | 61.593 | 0 |
| 17.0 | 61.712 | 0 |
| 17.0 | 61.83 | 0 |
| 17.0 | 61.949 | 0 |
| 17.0 | 62.066 | 50 |
| 17.0 | 62.184 | 50 |
| 17.0 | 62.301 | 50 |
| 17.0 | 62.417 | 50 |
| 18.0 | 62.533 | 50 |
| 18.0 | 62.649 | 0 |
| 18.0 | 62.764 | 0 |
| 18.0 | 62.879 | 0 |
| 18.0 | 62.994 | 0 |
| 18.0 | 63.108 | 0 |
| 18.0 | 63.221 | 0 |
| 18.0 | 63.334 | 0 |
| 18.0 | 63.447 | 0 |
| 18.0 | 63.559 | 0 |
| 18.0 | 63.67 | 0 |
| 18.0 | 63.781 | 50 |
| 18.0 | 63.892 | 50 |
| 18.0 | 64.002 | 50 |
| 18.0 | 64.112 | 50 |
| 18.0 | 64.221 | 50 |
| 18.0 | 64.33 | 0 |
| 18.0 | 64.438 | 0 |
| 18.0 | 64.545 | 0 |
| 18.0 | 64.652 | 0 |
| 18.0 | 64.759 | 0 |
| 18.0 | 64.865 | 0 |
| 18.0 | 64.97 | 0 |
| 18.0 | 65.075 | 0 |
| 18.0 | 65.179 | 0 |
| 18.0 | 65.283 | 50 |
| 18.0 | 65.386 | 50 |
| 18.0 | 65.489 | 50 |
| 18.0 | 65.591 | 50 |
| 18.0 | 65.692 | 50 |
| 18.0 | 65.793 | 0 |
| 18.0 | 65.893 | 0 |
| 18.0 | 65.993 | 0 |
| 18.0 | 66.092 | 0 |
| 18.0 | 66.19 | 0 |
| 18.0 | 66.288 | 0 |
| 18.0 | 66.385 | 0 |
| 18.0 | 66.482 | 0 |
| 18.0 | 66.577 | 50 |
| 18.0 | 66.673 | 50 |
| 18.0 | 66.767 | 50 |
| 18.0 | 66.861 | 50 |
| 18.0 | 66.954 | 50 |
| 18.0 | 67.047 | 0 |
| 18.0 | 67.139 | 0 |
| 18.0 | 67.23 | 0 |
| 18.0 | 67.321 | 0 |
| 18.0 | 67.411 | 0 |
| 18.0 | 67.5 | 0 |
| 18.0 | 67.588 | 0 |
| 18.0 | 67.676 | 0 |
| 18.0 | 67.763 | 50 |
| 18.0 | 67.85 | 50 |
| 18.0 | 67.935 | 50 |
| 18.0 | 68.02 | 50 |
| 18.0 | 68.105 | 50 |
| 18.0 | 68.188 | 0 |
| 18.0 | 68.271 | 0 |
| 18.0 | 68.353 | 0 |
| 18.0 | 68.434 | 0 |
| 19.0 | 68.515 | 0 |
| 19.0 | 68.595 | 0 |
| 19.0 | 68.674 | 0 |
| 19.0 | 68.752 | 50 |
| 19.0 | 68.829 | 50 |
| 19.0 | 68.906 | 50 |
| 19.0 | 68.982 | 50 |
| 19.0 | 69.057 | 50 |
| 19.0 | 69.132 | 0 |
| 19.0 | 69.205 | 0 |
| 19.0 | 69.278 | 0 |
| 19.0 | 69.35 | 0 |
| 19.0 | 69.421 | 0 |
| 19.0 | 69.492 | 0 |
| 19.0 | 69.561 | 0 |
| 19.0 | 69.63 | 50 |
| 19.0 | 69.698 | 50 |
| 19.0 | 69.765 | 50 |
| 19.0 | 69.831 | 50 |
| 19.0 | 69.897 | 50 |
| 19.0 | 69.961 | 0 |
| 19.0 | 70.025 | 0 |
| 19.0 | 70.088 | 0 |
| 19.0 | 70.15 | 0 |
| 19.0 | 70.211 | 0 |
| 19.0 | 70.272 | 0 |
| 19.0 | 70.331 | 50 |
| 19.0 | 70.39 | 50 |
| 19.0 | 70.448 | 50 |
| 19.0 | 70.504 | 50 |
| 19.0 | 70.561 | 50 |
| 19.0 | 70.616 | 0 |
| 19.0 | 70.67 | 0 |
| 19.0 | 70.723 | 0 |
| 19.0 | 70.776 | 0 |
| 19.0 | 70.827 | 0 |
| 19.0 | 70.878 | 0 |
| 19.0 | 70.928 | 50 |
| 19.0 | 70.977 | 50 |
| 19.0 | 71.025 | 50 |
| 19.0 | 71.072 | 50 |
| 19.0 | 71.118 | 50 |
| 19.0 | 71.163 | 0 |
| 19.0 | 71.207 | 0 |
| 19.0 | 71.251 | 0 |
| 19.0 | 71.293 | 0 |
| 19.0 | 71.334 | 0 |
| 19.0 | 71.375 | 0 |
| 19.0 | 71.415 | 50 |
| 19.0 | 71.453 | 50 |
| 19.0 | 71.491 | 50 |
| 19.0 | 71.528 | 50 |
| 19.0 | 71.564 | 50 |
| 19.0 | 71.598 | 0 |
| 19.0 | 71.632 | 0 |
| 19.0 | 71.665 | 0 |
| 19.0 | 71.697 | 0 |
| 19.0 | 71.728 | 0 |
| 19.0 | 71.758 | 0 |
| 19.0 | 71.787 | 50 |
| 20.0 | 71.815 | 50 |
| 20.0 | 71.842 | 50 |
| 20.0 | 71.869 | 50 |
| 20.0 | 71.894 | 50 |
| 20.0 | 71.918 | 0 |
| 20.0 | 71.941 | 0 |
| 20.0 | 71.963 | 0 |
| 20.0 | 71.984 | 0 |
| 20.0 | 72.005 | 0 |
| 20.0 | 72.024 | 50 |
| 20.0 | 72.042 | 50 |
| 20.0 | 72.059 | 50 |
| 20.0 | 72.075 | 50 |
| 20.0 | 72.09 | 50 |
| 20.0 | 72.105 | 0 |
| 20.0 | 72.118 | 0 |
| 20.0 | 72.13 | 0 |
| 20.0 | 72.141 | 0 |
| 20.0 | 72.151 | 0 |
| 20.0 | 72.16 | 50 |
| 20.0 | 72.168 | 50 |
| 20.0 | 72.175 | 50 |
| 20.0 | 72.181 | 50 |
| 20.0 | 72.186 | 50 |
| 20.0 | 72.19 | 0 |
| 20.0 | 72.193 | 0 |
| 20.0 | 72.195 | 0 |
| 20.0 | 72.196 | 0 |
| 20.0 | 72.195 | 0 |
| 20.0 | 72.194 | 50 |
| 20.0 | 72.192 | 50 |
| 20.0 | 72.189 | 50 |
| 20.0 | 72.184 | 50 |
| 20.0 | 72.179 | 50 |
| 20.0 | 72.172 | 0 |
| 20.0 | 72.165 | 0 |
| 20.0 | 72.156 | 0 |
| 20.0 | 72.147 | 0 |
| 20.0 | 72.136 | 0 |
| 20.0 | 72.124 | 50 |
| 20.0 | 72.112 | 50 |
| 20.0 | 72.098 | 50 |
| 20.0 | 72.083 | 50 |
| 20.0 | 72.067 | 50 |
| 20.0 | 72.05 | 0 |
| 20.0 | 72.032 | 0 |
| 20.0 | 72.013 | 0 |
| 20.0 | 71.993 | 0 |
| 20.0 | 71.972 | 0 |
| 20.0 | 71.949 | 0 |
| 20.0 | 71.926 | 50 |
| 20.0 | 71.902 | 50 |
| 20.0 | 71.876 | 50 |
| 20.0 | 71.85 | 50 |
| 20.0 | 71.822 | 50 |
| 20.0 | 71.793 | 0 |
| 20.0 | 71.764 | 0 |
| 20.0 | 71.733 | 0 |
| 20.0 | 71.701 | 0 |
| 20.0 | 71.668 | 0 |
| 21.0 | 71.634 | 0 |
| 21.0 | 71.599 | 50 |
| 21.0 | 71.563 | 50 |
| 21.0 | 71.526 | 50 |
| 21.0 | 71.487 | 50 |
| 21.0 | 71.448 | 50 |
| 21.0 | 71.408 | 0 |
| 21.0 | 71.366 | 0 |
| 21.0 | 71.324 | 0 |
| 21.0 | 71.28 | 0 |
| 21.0 | 71.235 | 0 |
| 21.0 | 71.19 | 0 |
| 21.0 | 71.143 | 50 |
| 21.0 | 71.095 | 50 |
| 21.0 | 71.046 | 50 |
| 21.0 | 70.996 | 50 |
| 21.0 | 70.945 | 50 |
| 21.0 | 70.893 | 0 |
| 21.0 | 70.839 | 0 |
| 21.0 | 70.785 | 0 |
| 21.0 | 70.73 | 0 |
| 21.0 | 70.673 | 0 |
| 21.0 | 70.616 | 0 |
| 21.0 | 70.557 | 50 |
| 21.0 | 70.498 | 50 |
| 21.0 | 70.437 | 50 |
| 21.0 | 70.376 | 50 |
| 21.0 | 70.313 | 50 |
| 21.0 | 70.249 | 0 |
| 21.0 | 70.184 | 0 |
| 21.0 | 70.118 | 0 |
| 21.0 | 70.051 | 0 |
| 21.0 | 69.983 | 0 |
| 21.0 | 69.914 | 0 |
| 21.0 | 69.844 | 0 |
| 21.0 | 69.773 | 50 |
| 21.0 | 69.7 | 50 |
| 21.0 | 69.627 | 50 |
| 21.0 | 69.553 | 50 |
| 21.0 | 69.477 | 50 |
| 21.0 | 69.401 | 0 |
| 21.0 | 69.323 | 0 |
| 21.0 | 69.245 | 0 |
| 21.0 | 69.165 | 0 |
| 21.0 | 69.085 | 0 |
| 21.0 | 69.003 | 0 |
| 21.0 | 68.92 | 0 |
| 21.0 | 68.837 | 50 |
| 21.0 | 68.752 | 50 |
| 21.0 | 68.666 | 50 |
| 21.0 | 68.579 | 50 |
| 21.0 | 68.492 | 50 |
| 21.0 | 68.403 | 0 |
| 21.0 | 68.313 | 0 |
| 21.0 | 68.222 | 0 |
| 21.0 | 68.13 | 0 |
| 21.0 | 68.037 | 0 |
| 21.0 | 67.943 | 0 |
| 21.0 | 67.848 | 0 |
| 21.0 | 67.752 | 0 |
| 22.0 | 67.655 | 50 |
| 22.0 | 67.557 | 50 |
| 22.0 | 67.458 | 50 |
| 22.0 | 67.358 | 50 |
| 22.0 | 67.257 | 50 |
| 22.0 | 67.155 | 0 |
| 22.0 | 67.052 | 0 |
| 22.0 | 66.948 | 0 |
| 22.0 | 66.844 | 0 |
| 22.0 | 66.738 | 0 |
| 22.0 | 66.631 | 0 |
| 22.0 | 66.523 | 0 |
| 22.0 | 66.414 | 0 |
| 22.0 | 66.304 | 50 |
| 22.0 | 66.193 | 50 |
| 22.0 | 66.082 | 50 |
| 22.0 | 65.969 | 50 |
| 22.0 | 65.855 | 50 |
| 22.0 | 65.74 | 0 |
| 22.0 | 65.625 | 0 |
| 22.0 | 65.508 | 0 |
| 22.0 | 65.391 | 0 |
| 22.0 | 65.272 | 0 |
| 22.0 | 65.153 | 0 |
| 22.0 | 65.032 | 0 |
| 22.0 | 64.911 | 0 |
| 22.0 | 64.789 | 0 |
| 22.0 | 64.666 | 50 |
| 22.0 | 64.541 | 50 |
| 22.0 | 64.416 | 50 |
| 22.0 | 64.29 | 50 |
| 22.0 | 64.164 | 50 |
| 22.0 | 64.036 | 0 |
| 22.0 | 63.907 | 0 |
| 22.0 | 63.778 | 0 |
| 22.0 | 63.647 | 0 |
| 22.0 | 63.516 | 0 |
| 22.0 | 63.383 | 0 |
| 22.0 | 63.25 | 0 |
| 22.0 | 63.116 | 0 |
| 22.0 | 62.981 | 0 |
| 22.0 | 62.845 | 0 |
| 22.0 | 62.708 | 50 |
| 22.0 | 62.571 | 50 |
| 22.0 | 62.432 | 50 |
| 22.0 | 62.293 | 50 |
| 22.0 | 62.153 | 50 |
| 22.0 | 62.012 | 0 |
| 22.0 | 61.87 | 0 |
| 22.0 | 61.727 | 0 |
| 22.0 | 61.583 | 0 |
| 22.0 | 61.439 | 0 |
| 22.0 | 61.294 | 0 |
| 22.0 | 61.148 | 0 |
| 22.0 | 61.001 | 0 |
| 22.0 | 60.853 | 0 |
| 22.0 | 60.704 | 0 |
| 22.0 | 60.555 | 0 |
| 22.0 | 60.405 | 50 |
| 22.0 | 60.254 | 50 |
| 23.0 | 60.102 | 50 |
| 23.0 | 59.949 | 50 |
| 23.0 | 59.796 | 50 |
| 23.0 | 59.641 | 0 |
| 23.0 | 59.486 | 0 |
| 23.0 | 59.331 | 0 |
| 23.0 | 59.174 | 0 |
| 23.0 | 59.017 | 0 |
| 23.0 | 58.859 | 0 |
| 23.0 | 58.7 | 0 |
| 23.0 | 58.54 | 0 |
| 23.0 | 58.38 | 0 |
| 23.0 | 58.219 | 0 |
| 23.0 | 58.057 | 0 |
| 23.0 | 57.894 | 0 |
| 23.0 | 57.731 | 0 |
| 23.0 | 57.567 | 50 |
| 23.0 | 57.402 | 50 |
| 23.0 | 57.237 | 50 |
| 23.0 | 57.071 | 50 |
| 23.0 | 56.904 | 50 |
| 23.0 | 56.736 | 0 |
| 23.0 | 56.568 | 0 |
| 23.0 | 56.399 | 0 |
| 23.0 | 56.229 | 0 |
| 23.0 | 56.059 | 0 |
| 23.0 | 55.888 | 0 |
| 23.0 | 55.716 | 0 |
| 23.0 | 55.544 | 0 |
| 23.0 | 55.371 | 0 |
| 23.0 | 55.197 | 0 |
| 23.0 | 55.023 | 0 |
| 23.0 | 54.848 | 0 |
| 23.0 | 54.673 | 0 |
| 23.0 | 54.496 | 0 |
| 23.0 | 54.32 | 50 |
| 23.0 | 54.142 | 50 |
| 23.0 | 53.964 | 50 |
| 23.0 | 53.785 | 50 |
| 23.0 | 53.606 | 50 |
| 23.0 | 53.426 | 0 |
| 23.0 | 53.246 | 0 |
| 23.0 | 53.065 | 0 |
| 23.0 | 52.883 | 0 |
| 23.0 | 52.701 | 0 |
| 23.0 | 52.518 | 0 |
| 23.0 | 52.335 | 0 |
| 23.0 | 52.151 | 0 |
| 23.0 | 51.967 | 0 |
| 23.0 | 51.782 | 0 |
| 23.0 | 51.596 | 0 |
| 23.0 | 51.41 | 0 |
| 23.0 | 51.224 | 0 |
| 23.0 | 51.037 | 0 |
| 23.0 | 50.849 | 0 |
| 23.0 | 50.661 | 0 |
| 23.0 | 50.472 | 50 |
| 23.0 | 50.283 | 50 |
| 23.0 | 50.094 | 50 |
| 23.0 | 49.904 | 50 |
| 24.0 | 49.713 | 50 |
| 24.0 | 49.522 | 0 |
| 24.0 | 49.331 | 0 |
| 24.0 | 49.139 | 0 |
| 24.0 | 48.946 | 0 |
| 24.0 | 48.753 | 0 |
| 24.0 | 48.56 | 0 |
| 24.0 | 48.366 | 0 |
| 24.0 | 48.172 | 0 |
| 24.0 | 47.978 | 0 |
| 24.0 | 47.783 | 0 |
| 24.0 | 47.587 | 0 |
| 24.0 | 47.392 | 0 |
| 24.0 | 47.195 | 0 |
| 24.0 | 46.999 | 0 |
| 24.0 | 46.802 | 0 |
| 24.0 | 46.605 | 0 |
| 24.0 | 46.407 | 0 |
| 24.0 | 46.209 | 0 |
| 24.0 | 46.011 | 50 |
| 24.0 | 45.812 | 50 |
| 24.0 | 45.613 | 50 |
| 24.0 | 45.413 | 50 |
| 24.0 | 45.214 | 50 |
| 24.0 | 45.013 | 0 |
| 24.0 | 44.813 | 0 |
| 24.0 | 44.612 | 0 |
| 24.0 | 44.411 | 0 |
| 24.0 | 44.21 | 0 |
| 24.0 | 44.009 | 0 |
| 24.0 | 43.807 | 0 |
| 24.0 | 43.605 | 0 |
| 24.0 | 43.402 | 0 |
| 24.0 | 43.199 | 0 |
| 24.0 | 42.997 | 0 |
| 24.0 | 42.793 | 0 |
| 24.0 | 42.59 | 0 |
| 24.0 | 42.386 | 0 |
| 24.0 | 42.182 | 0 |
| 24.0 | 41.978 | 0 |
| 24.0 | 41.774 | 0 |
| 24.0 | 41.57 | 0 |
| 24.0 | 41.365 | 0 |
| 24.0 | 41.16 | 0 |
| 24.0 | 40.955 | 0 |
| 24.0 | 40.75 | 50 |
| 24.0 | 40.544 | 50 |
| 24.0 | 40.339 | 50 |
| 24.0 | 40.133 | 50 |
| 24.0 | 39.927 | 50 |
| 24.0 | 39.721 | 0 |
| 24.0 | 39.515 | 0 |
| 24.0 | 39.308 | 0 |
| 24.0 | 39.102 | 0 |
| 24.0 | 38.895 | 0 |
| 24.0 | 38.689 | 0 |
| 24.0 | 38.482 | 0 |
| 24.0 | 38.275 | 0 |
| 24.0 | 38.068 | 0 |
| 24.0 | 37.861 | 0 |
| 25.0 | 37.654 | 0 |
| 25.0 | 37.447 | 0 |
| 25.0 | 37.24 | 0 |
| 25.0 | 37.032 | 0 |
| 25.0 | 36.825 | 0 |
| 25.0 | 36.618 | 0 |
| 25.0 | 36.41 | 0 |
| 25.0 | 36.203 | 0 |
| 25.0 | 35.995 | 0 |
| 25.0 | 35.788 | 0 |
| 25.0 | 35.58 | 0 |
| 25.0 | 35.373 | 0 |
| 25.0 | 35.166 | 0 |
| 25.0 | 34.958 | 0 |
| 25.0 | 34.751 | 50 |
| 25.0 | 34.543 | 50 |
| 25.0 | 34.336 | 50 |
| 25.0 | 34.129 | 50 |
| 25.0 | 33.922 | 50 |
| 25.0 | 33.715 | 0 |
| 25.0 | 33.508 | 0 |
| 25.0 | 33.301 | 0 |
| 25.0 | 33.094 | 0 |
| 25.0 | 32.887 | 0 |
| 25.0 | 32.68 | 0 |
| 25.0 | 32.473 | 0 |
| 25.0 | 32.267 | 0 |
| 25.0 | 32.061 | 0 |
| 25.0 | 31.854 | 0 |
| 25.0 | 31.648 | 0 |
| 25.0 | 31.442 | 0 |
| 25.0 | 31.236 | 0 |
| 25.0 | 31.031 | 0 |
| 25.0 | 30.825 | 0 |
| 25.0 | 30.62 | 0 |
| 25.0 | 30.415 | 0 |
| 25.0 | 30.21 | 0 |
| 25.0 | 30.005 | 0 |
| 25.0 | 29.8 | 0 |
| 25.0 | 29.596 | 0 |
| 25.0 | 29.392 | 0 |
| 25.0 | 29.188 | 0 |
| 25.0 | 28.984 | 0 |
| 25.0 | 28.781 | 0 |
| 25.0 | 28.577 | 0 |
| 25.0 | 28.374 | 0 |
| 25.0 | 28.172 | 50 |
| 25.0 | 27.969 | 50 |
| 25.0 | 27.767 | 50 |
| 25.0 | 27.565 | 50 |
| 25.0 | 27.363 | 50 |
| 25.0 | 27.162 | 0 |
| 25.0 | 26.961 | 0 |
| 25.0 | 26.76 | 0 |
| 25.0 | 26.56 | 0 |
| 25.0 | 26.36 | 0 |
| 25.0 | 26.16 | 0 |
| 25.0 | 25.96 | 0 |
| 25.0 | 25.761 | 0 |
| 25.0 | 25.563 | 0 |
| 26.0 | 25.364 | 0 |
| 26.0 | 25.166 | 0 |
| 26.0 | 24.968 | 0 |
| 26.0 | 24.771 | 0 |
| 26.0 | 24.574 | 0 |
| 26.0 | 24.378 | 0 |
| 26.0 | 24.182 | 0 |
| 26.0 | 23.986 | 0 |
| 26.0 | 23.791 | 0 |
| 26.0 | 23.596 | 0 |
| 26.0 | 23.401 | 0 |
| 26.0 | 23.207 | 0 |
| 26.0 | 23.014 | 0 |
| 26.0 | 22.82 | 0 |
| 26.0 | 22.628 | 0 |
| 26.0 | 22.435 | 0 |
| 26.0 | 22.244 | 0 |
| 26.0 | 22.052 | 0 |
| 26.0 | 21.862 | 0 |
| 26.0 | 21.671 | 0 |
| 26.0 | 21.481 | 0 |
| 26.0 | 21.292 | 0 |
| 26.0 | 21.103 | 50 |
| 26.0 | 20.915 | 50 |
| 26.0 | 20.727 | 50 |
| 26.0 | 20.54 | 50 |
| 26.0 | 20.353 | 50 |
| 26.0 | 20.167 | 0 |
| 26.0 | 19.981 | 0 |
| 26.0 | 19.796 | 0 |
| 26.0 | 19.612 | 0 |
| 26.0 | 19.428 | 0 |
| 26.0 | 19.244 | 0 |
| 26.0 | 19.061 | 0 |
| 26.0 | 18.879 | 0 |
| 26.0 | 18.698 | 0 |
| 26.0 | 18.517 | 0 |
| 26.0 | 18.336 | 0 |
| 26.0 | 18.156 | 0 |
| 26.0 | 17.977 | 0 |
| 26.0 | 17.799 | 0 |
| 26.0 | 17.621 | 0 |
| 26.0 | 17.443 | 0 |
| 26.0 | 17.267 | 0 |
| 26.0 | 17.091 | 0 |
| 26.0 | 16.916 | 0 |
| 26.0 | 16.741 | 0 |
| 26.0 | 16.567 | 0 |
| 26.0 | 16.394 | 0 |
| 26.0 | 16.221 | 0 |
| 26.0 | 16.049 | 0 |
| 26.0 | 15.878 | 0 |
| 26.0 | 15.707 | 0 |
| 26.0 | 15.537 | 0 |
| 26.0 | 15.368 | 0 |
| 26.0 | 15.2 | 0 |
| 26.0 | 15.032 | 0 |
| 26.0 | 14.865 | 0 |
| 26.0 | 14.699 | 0 |
| 26.0 | 14.534 | 0 |
| 27.0 | 14.369 | 0 |
| 27.0 | 14.205 | 50 |
| 27.0 | 14.042 | 50 |
| 27.0 | 13.88 | 50 |
| 27.0 | 13.718 | 50 |
| 27.0 | 13.557 | 50 |
| 27.0 | 13.397 | 0 |
| 27.0 | 13.238 | 0 |
| 27.0 | 13.079 | 0 |
| 27.0 | 12.922 | 0 |
| 27.0 | 12.765 | 0 |
| 27.0 | 12.609 | 0 |
| 27.0 | 12.454 | 0 |
| 27.0 | 12.299 | 0 |
| 27.0 | 12.146 | 0 |
| 27.0 | 11.993 | 0 |
| 27.0 | 11.841 | 0 |
| 27.0 | 11.69 | 0 |
| 27.0 | 11.54 | 0 |
| 27.0 | 11.391 | 0 |
| 27.0 | 11.242 | 0 |
| 27.0 | 11.095 | 0 |
| 27.0 | 10.948 | 0 |
| 27.0 | 10.802 | 0 |
| 27.0 | 10.657 | 0 |
| 27.0 | 10.513 | 0 |
| 27.0 | 10.37 | 0 |
| 27.0 | 10.228 | 0 |
| 27.0 | 10.087 | 0 |
| 27.0 | 9.947 | 0 |
| 27.0 | 9.807 | 0 |
| 27.0 | 9.669 | 0 |
| 27.0 | 9.531 | 0 |
| 27.0 | 9.394 | 0 |
| 27.0 | 9.259 | 0 |
| 27.0 | 9.124 | 0 |
| 27.0 | 8.99 | 0 |
| 27.0 | 8.857 | 0 |
| 27.0 | 8.725 | 0 |
| 27.0 | 8.595 | 0 |
| 27.0 | 8.465 | 0 |
| 27.0 | 8.336 | 0 |
| 27.0 | 8.208 | 0 |
| 27.0 | 8.081 | 50 |
| 27.0 | 7.955 | 50 |
| 27.0 | 7.83 | 50 |
| 27.0 | 7.706 | 50 |
| 27.0 | 7.583 | 50 |
| 27.0 | 7.461 | 0 |
| 27.0 | 7.34 | 0 |
| 27.0 | 7.22 | 0 |
| 27.0 | 7.101 | 0 |
| 27.0 | 6.983 | 0 |
| 27.0 | 6.866 | 0 |
| 27.0 | 6.75 | 0 |
| 27.0 | 6.636 | 0 |
| 27.0 | 6.522 | 0 |
| 27.0 | 6.409 | 0 |
| 27.0 | 6.298 | 0 |
| 27.0 | 6.187 | 0 |
| 28.0 | 6.078 | 0 |
| 28.0 | 5.969 | 0 |
| 28.0 | 5.862 | 0 |
| 28.0 | 5.755 | 0 |
| 28.0 | 5.65 | 0 |
| 28.0 | 5.546 | 0 |
| 28.0 | 5.443 | 0 |
| 28.0 | 5.341 | 0 |
| 28.0 | 5.24 | 0 |
| 28.0 | 5.141 | 0 |
| 28.0 | 5.042 | 0 |
| 28.0 | 4.944 | 0 |
| 28.0 | 4.848 | 0 |
| 28.0 | 4.753 | 0 |
| 28.0 | 4.659 | 0 |
| 28.0 | 4.566 | 0 |
| 28.0 | 4.474 | 0 |
| 28.0 | 4.383 | 0 |
| 28.0 | 4.293 | 0 |
| 28.0 | 4.205 | 0 |
| 28.0 | 4.117 | 0 |
| 28.0 | 4.031 | 0 |
| 28.0 | 3.946 | 0 |
| 28.0 | 3.862 | 0 |
| 28.0 | 3.779 | 0 |
| 28.0 | 3.698 | 0 |
| 28.0 | 3.617 | 0 |
| 28.0 | 3.538 | 0 |
| 28.0 | 3.46 | 50 |
| 28.0 | 3.383 | 50 |
| 28.0 | 3.307 | 50 |
| 28.0 | 3.232 | 50 |
| 28.0 | 3.159 | 50 |
| 28.0 | 3.087 | 0 |
| 28.0 | 3.016 | 0 |
| 28.0 | 2.946 | 0 |
| 28.0 | 2.877 | 0 |
| 28.0 | 2.81 | 0 |
| 28.0 | 2.744 | 0 |
| 28.0 | 2.679 | 0 |
| 28.0 | 2.615 | 0 |
| 28.0 | 2.552 | 0 |
| 28.0 | 2.491 | 0 |
| 28.0 | 2.43 | 0 |
| 28.0 | 2.371 | 0 |
| 28.0 | 2.314 | 0 |
| 28.0 | 2.257 | 0 |
| 28.0 | 2.202 | 0 |
| 28.0 | 2.147 | 0 |
| 28.0 | 2.095 | 0 |
| 28.0 | 2.043 | 0 |
| 28.0 | 1.992 | 0 |
| 28.0 | 1.943 | 0 |
| 28.0 | 1.895 | 0 |
| 28.0 | 1.848 | 0 |
| 28.0 | 1.803 | 0 |
| 28.0 | 1.759 | 0 |
| 28.0 | 1.716 | 0 |
| 28.0 | 1.674 | 0 |
| 28.0 | 1.633 | 0 |
| 29.0 | 1.594 | 0 |
| 29.0 | 1.556 | 0 |
| 29.0 | 1.519 | 0 |
| 29.0 | 1.484 | 0 |
| 29.0 | 1.45 | 0 |
| 29.0 | 1.417 | 0 |
| 29.0 | 1.385 | 0 |
| 29.0 | 1.354 | 0 |
| 29.0 | 1.325 | 0 |
| 29.0 | 1.297 | 0 |
| 29.0 | 1.271 | 0 |
| 29.0 | 1.245 | 0 |
| 29.0 | 1.221 | 0 |
| 29.0 | 1.198 | 0 |
| 29.0 | 1.176 | 50 |
| 29.0 | 1.156 | 50 |
| 29.0 | 1.137 | 50 |
| 29.0 | 1.119 | 50 |
| 29.0 | 1.103 | 50 |
| 29.0 | 1.088 | 0 |
| 29.0 | 1.074 | 0 |
| 29.0 | 1.061 | 0 |
| 29.0 | 1.05 | 0 |
| 29.0 | 1.039 | 0 |
| 29.0 | 1.031 | 0 |
| 29.0 | 1.023 | 0 |
| 29.0 | 1.017 | 0 |
| 29.0 | 1.012 | 0 |
| 29.0 | 1.008 | 0 |
| 29.0 | 1.006 | 0 |
| 29.0 | 1.005 | 0 |
| 29.0 | 1.005 | 0 |
| 29.0 | 1.006 | 0 |
| 29.0 | 1.009 | 0 |
| 29.0 | 1.013 | 0 |
| 29.0 | 1.018 | 0 |
| 29.0 | 1.025 | 0 |
| 29.0 | 1.033 | 0 |
| 29.0 | 1.042 | 0 |
| 29.0 | 1.053 | 0 |
| 29.0 | 1.064 | 0 |
| 29.0 | 1.077 | 0 |
| 29.0 | 1.092 | 0 |
| 29.0 | 1.107 | 0 |
| 29.0 | 1.124 | 0 |
| 29.0 | 1.142 | 0 |
| 29.0 | 1.162 | 0 |
| 29.0 | 1.183 | 0 |
| 29.0 | 1.205 | 0 |
| 29.0 | 1.228 | 0 |
| 29.0 | 1.253 | 0 |
| 29.0 | 1.279 | 0 |
| 29.0 | 1.306 | 0 |
| 29.0 | 1.335 | 0 |
| 29.0 | 1.364 | 0 |
| 29.0 | 1.395 | 0 |
| 29.0 | 1.428 | 0 |
| 29.0 | 1.461 | 0 |
| 29.0 | 1.496 | 0 |
| 29.0 | 1.533 | 0 |
| 30.0 | 1.57 | 50 |
| 30.0 | 1.609 | 50 |
| 30.0 | 1.649 | 50 |
| 30.0 | 1.69 | 50 |
| 30.0 | 1.733 | 50 |
| 30.0 | 1.777 | 0 |
| 30.0 | 1.822 | 0 |
| 30.0 | 1.869 | 0 |
| 30.0 | 1.916 | 0 |
| 30.0 | 1.965 | 0 |
| 30.0 | 2.016 | 0 |
| 30.0 | 2.067 | 0 |
| 30.0 | 2.12 | 0 |
| 30.0 | 2.174 | 0 |
| 30.0 | 2.23 | 0 |
| 30.0 | 2.286 | 0 |
| 30.0 | 2.344 | 0 |
| 30.0 | 2.403 | 0 |
| 30.0 | 2.464 | 0 |
| 30.0 | 2.525 | 0 |
| 30.0 | 2.588 | 0 |
| 30.0 | 2.653 | 0 |
| 30.0 | 2.718 | 0 |
| 30.0 | 2.785 | 0 |
| 30.0 | 2.853 | 0 |
| 30.0 | 2.922 | 0 |
| 30.0 | 2.992 | 0 |
| 30.0 | 3.064 | 0 |
| 30.0 | 3.137 | 0 |
| 30.0 | 3.211 | 0 |
| 30.0 | 3.287 | 0 |
| 30.0 | 3.363 | 0 |
| 30.0 | 3.441 | 0 |
| 30.0 | 3.52 | 0 |
| 30.0 | 3.601 | 0 |
| 30.0 | 3.682 | 0 |
| 30.0 | 3.765 | 0 |
| 30.0 | 3.849 | 0 |
| 30.0 | 3.935 | 0 |
| 30.0 | 4.021 | 0 |
| 30.0 | 4.109 | 0 |
| 30.0 | 4.198 | 0 |
| 30.0 | 4.288 | 0 |
| 30.0 | 4.379 | 0 |
| 30.0 | 4.472 | 50 |
| 30.0 | 4.566 | 50 |
| 30.0 | 4.661 | 50 |
| 30.0 | 4.757 | 50 |
| 30.0 | 4.854 | 50 |
| 30.0 | 4.953 | 0 |
| 30.0 | 5.052 | 0 |
| 30.0 | 5.153 | 0 |
| 30.0 | 5.255 | 0 |
| 30.0 | 5.359 | 0 |
| 30.0 | 5.463 | 0 |
| 30.0 | 5.569 | 0 |
| 30.0 | 5.676 | 0 |
| 30.0 | 5.784 | 0 |
| 30.0 | 5.893 | 0 |
| 30.0 | 6.003 | 0 |
| 31.0 | 6.115 | 0 |
| 31.0 | 6.227 | 0 |
| 31.0 | 6.341 | 0 |
| 31.0 | 6.456 | 0 |
| 31.0 | 6.572 | 0 |
| 31.0 | 6.689 | 0 |
| 31.0 | 6.807 | 0 |
| 31.0 | 6.927 | 0 |
| 31.0 | 7.048 | 0 |
| 31.0 | 7.169 | 0 |
| 31.0 | 7.292 | 0 |
| 31.0 | 7.416 | 0 |
| 31.0 | 7.541 | 0 |
| 31.0 | 7.668 | 0 |
| 31.0 | 7.795 | 0 |
| 31.0 | 7.923 | 0 |
| 31.0 | 8.053 | 0 |
| 31.0 | 8.183 | 0 |
| 31.0 | 8.315 | 0 |
| 31.0 | 8.448 | 0 |
| 31.0 | 8.582 | 0 |
| 31.0 | 8.717 | 0 |
| 31.0 | 8.853 | 0 |
| 31.0 | 8.99 | 0 |
| 31.0 | 9.128 | 0 |
| 31.0 | 9.267 | 0 |
| 31.0 | 9.408 | 50 |
| 31.0 | 9.549 | 50 |
| 31.0 | 9.692 | 50 |
| 31.0 | 9.835 | 50 |
| 31.0 | 9.98 | 50 |
| 31.0 | 10.125 | 0 |
| 31.0 | 10.272 | 0 |
| 31.0 | 10.419 | 0 |
| 31.0 | 10.568 | 0 |
| 31.0 | 10.718 | 0 |
| 31.0 | 10.868 | 0 |
| 31.0 | 11.02 | 0 |
| 31.0 | 11.173 | 0 |
| 31.0 | 11.326 | 0 |
| 31.0 | 11.481 | 0 |
| 31.0 | 11.637 | 0 |
| 31.0 | 11.793 | 0 |
| 31.0 | 11.951 | 0 |
| 31.0 | 12.109 | 0 |
| 31.0 | 12.269 | 0 |
| 31.0 | 12.43 | 0 |
| 31.0 | 12.591 | 0 |
| 31.0 | 12.754 | 0 |
| 31.0 | 12.917 | 0 |
| 31.0 | 13.081 | 0 |
| 31.0 | 13.247 | 0 |
| 31.0 | 13.413 | 0 |
| 31.0 | 13.58 | 0 |
| 31.0 | 13.748 | 0 |
| 31.0 | 13.917 | 0 |
| 31.0 | 14.087 | 0 |
| 31.0 | 14.258 | 0 |
| 31.0 | 14.43 | 0 |
| 31.0 | 14.602 | 0 |
| 32.0 | 14.776 | 0 |
| 32.0 | 14.95 | 0 |
| 32.0 | 15.125 | 0 |
| 32.0 | 15.302 | 0 |
| 32.0 | 15.479 | 0 |
| 32.0 | 15.656 | 50 |
| 32.0 | 15.835 | 50 |
| 32.0 | 16.015 | 50 |
| 32.0 | 16.195 | 50 |
| 32.0 | 16.377 | 50 |
| 32.0 | 16.559 | 0 |
| 32.0 | 16.742 | 0 |
| 32.0 | 16.926 | 0 |
| 32.0 | 17.11 | 0 |
| 32.0 | 17.296 | 0 |
| 32.0 | 17.482 | 0 |
| 32.0 | 17.669 | 0 |
| 32.0 | 17.857 | 0 |
| 32.0 | 18.045 | 0 |
| 32.0 | 18.235 | 0 |
| 32.0 | 18.425 | 0 |
| 32.0 | 18.616 | 0 |
| 32.0 | 18.808 | 0 |
| 32.0 | 19 | 0 |
| 32.0 | 19.193 | 0 |
| 32.0 | 19.387 | 0 |
| 32.0 | 19.582 | 0 |
| 32.0 | 19.778 | 0 |
| 32.0 | 19.974 | 0 |
| 32.0 | 20.171 | 0 |
| 32.0 | 20.368 | 0 |
| 32.0 | 20.567 | 0 |
| 32.0 | 20.766 | 0 |
| 32.0 | 20.965 | 0 |
| 32.0 | 21.166 | 0 |
| 32.0 | 21.367 | 0 |
| 32.0 | 21.569 | 0 |
| 32.0 | 21.771 | 0 |
| 32.0 | 21.974 | 0 |
| 32.0 | 22.178 | 0 |
| 32.0 | 22.383 | 50 |
| 32.0 | 22.588 | 50 |
| 32.0 | 22.793 | 50 |
| 32.0 | 23 | 50 |
| 32.0 | 23.207 | 50 |
| 32.0 | 23.414 | 0 |
| 32.0 | 23.623 | 0 |
| 32.0 | 23.831 | 0 |
| 32.0 | 24.041 | 0 |
| 32.0 | 24.251 | 0 |
| 32.0 | 24.461 | 0 |
| 32.0 | 24.673 | 0 |
| 32.0 | 24.884 | 0 |
| 32.0 | 25.097 | 0 |
| 32.0 | 25.31 | 0 |
| 32.0 | 25.523 | 0 |
| 32.0 | 25.737 | 0 |
| 32.0 | 25.952 | 0 |
| 32.0 | 26.167 | 0 |
| 32.0 | 26.382 | 0 |
| 33.0 | 26.598 | 0 |
| 33.0 | 26.815 | 0 |
| 33.0 | 27.032 | 0 |
| 33.0 | 27.25 | 0 |
| 33.0 | 27.468 | 0 |
| 33.0 | 27.686 | 0 |
| 33.0 | 27.905 | 0 |
| 33.0 | 28.125 | 0 |
| 33.0 | 28.345 | 0 |
| 33.0 | 28.565 | 0 |
| 33.0 | 28.786 | 0 |
| 33.0 | 29.008 | 0 |
| 33.0 | 29.23 | 50 |
| 33.0 | 29.452 | 50 |
| 33.0 | 29.674 | 50 |
| 33.0 | 29.897 | 50 |
| 33.0 | 30.121 | 50 |
| 33.0 | 30.345 | 0 |
| 33.0 | 30.569 | 0 |
| 33.0 | 30.794 | 0 |
| 33.0 | 31.019 | 0 |
| 33.0 | 31.244 | 0 |
| 33.0 | 31.47 | 0 |
| 33.0 | 31.696 | 0 |
| 33.0 | 31.922 | 0 |
| 33.0 | 32.149 | 0 |
| 33.0 | 32.376 | 0 |
| 33.0 | 32.604 | 0 |
| 33.0 | 32.832 | 0 |
| 33.0 | 33.06 | 0 |
| 33.0 | 33.288 | 0 |
| 33.0 | 33.517 | 0 |
| 33.0 | 33.746 | 0 |
| 33.0 | 33.975 | 0 |
| 33.0 | 34.205 | 0 |
| 33.0 | 34.434 | 0 |
| 33.0 | 34.664 | 0 |
| 33.0 | 34.895 | 0 |
| 33.0 | 35.125 | 0 |
| 33.0 | 35.356 | 0 |
| 33.0 | 35.587 | 0 |
| 33.0 | 35.819 | 50 |
| 33.0 | 36.05 | 50 |
| 33.0 | 36.282 | 50 |
| 33.0 | 36.514 | 50 |
| 33.0 | 36.746 | 50 |
| 33.0 | 36.978 | 0 |
| 33.0 | 37.211 | 0 |
| 33.0 | 37.443 | 0 |
| 33.0 | 37.676 | 0 |
| 33.0 | 37.909 | 0 |
| 33.0 | 38.142 | 0 |
| 33.0 | 38.375 | 0 |
| 33.0 | 38.609 | 0 |
| 33.0 | 38.842 | 0 |
| 33.0 | 39.076 | 0 |
| 33.0 | 39.31 | 0 |
| 33.0 | 39.544 | 0 |
| 33.0 | 39.778 | 0 |
| 33.0 | 40.012 | 0 |
| 34.0 | 40.246 | 0 |
| 34.0 | 40.48 | 0 |
| 34.0 | 40.715 | 0 |
| 34.0 | 40.949 | 0 |
| 34.0 | 41.184 | 0 |
| 34.0 | 41.418 | 0 |
| 34.0 | 41.653 | 0 |
| 34.0 | 41.887 | 50 |
| 34.0 | 42.122 | 50 |
| 34.0 | 42.356 | 50 |
| 34.0 | 42.591 | 50 |
| 34.0 | 42.826 | 50 |
| 34.0 | 43.06 | 0 |
| 34.0 | 43.295 | 0 |
| 34.0 | 43.529 | 0 |
| 34.0 | 43.764 | 0 |
| 34.0 | 43.999 | 0 |
| 34.0 | 44.233 | 0 |
| 34.0 | 44.467 | 0 |
| 34.0 | 44.702 | 0 |
| 34.0 | 44.936 | 0 |
| 34.0 | 45.17 | 0 |
| 34.0 | 45.405 | 0 |
| 34.0 | 45.639 | 0 |
| 34.0 | 45.873 | 0 |
| 34.0 | 46.107 | 0 |
| 34.0 | 46.34 | 0 |
| 34.0 | 46.574 | 0 |
| 34.0 | 46.808 | 0 |
| 34.0 | 47.041 | 0 |
| 34.0 | 47.274 | 50 |
| 34.0 | 47.508 | 50 |
| 34.0 | 47.741 | 50 |
| 34.0 | 47.973 | 50 |
| 34.0 | 48.206 | 50 |
| 34.0 | 48.439 | 0 |
| 34.0 | 48.671 | 0 |
| 34.0 | 48.903 | 0 |
| 34.0 | 49.135 | 0 |
| 34.0 | 49.367 | 0 |
| 34.0 | 49.598 | 0 |
| 34.0 | 49.83 | 0 |
| 34.0 | 50.061 | 0 |
| 34.0 | 50.292 | 0 |
| 34.0 | 50.522 | 0 |
| 34.0 | 50.753 | 0 |
| 34.0 | 50.983 | 0 |
| 34.0 | 51.213 | 0 |
| 34.0 | 51.442 | 0 |
| 34.0 | 51.672 | 0 |
| 34.0 | 51.901 | 0 |
| 34.0 | 52.13 | 50 |
| 34.0 | 52.358 | 50 |
| 34.0 | 52.586 | 50 |
| 34.0 | 52.814 | 50 |
| 34.0 | 53.042 | 50 |
| 34.0 | 53.269 | 0 |
| 34.0 | 53.496 | 0 |
| 34.0 | 53.722 | 0 |
| 34.0 | 53.949 | 0 |
| 35.0 | 54.174 | 0 |
| 35.0 | 54.4 | 0 |
| 35.0 | 54.625 | 0 |
| 35.0 | 54.85 | 0 |
| 35.0 | 55.074 | 0 |
| 35.0 | 55.298 | 0 |
| 35.0 | 55.522 | 0 |
| 35.0 | 55.745 | 0 |
| 35.0 | 55.968 | 0 |
| 35.0 | 56.19 | 0 |
| 35.0 | 56.412 | 50 |
| 35.0 | 56.634 | 50 |
| 35.0 | 56.855 | 50 |
| 35.0 | 57.076 | 50 |
| 35.0 | 57.296 | 50 |
| 35.0 | 57.516 | 0 |
| 35.0 | 57.735 | 0 |
| 35.0 | 57.954 | 0 |
| 35.0 | 58.172 | 0 |
| 35.0 | 58.39 | 0 |
| 35.0 | 58.608 | 0 |
| 35.0 | 58.824 | 0 |
| 35.0 | 59.041 | 0 |
| 35.0 | 59.257 | 0 |
| 35.0 | 59.472 | 0 |
| 35.0 | 59.687 | 0 |
| 35.0 | 59.901 | 0 |
| 35.0 | 60.115 | 50 |
| 35.0 | 60.328 | 50 |
| 35.0 | 60.541 | 50 |
| 35.0 | 60.753 | 50 |
| 35.0 | 60.965 | 50 |
| 35.0 | 61.176 | 0 |
| 35.0 | 61.387 | 0 |
| 35.0 | 61.596 | 0 |
| 35.0 | 61.806 | 0 |
| 35.0 | 62.015 | 0 |
| 35.0 | 62.223 | 0 |
| 35.0 | 62.43 | 0 |
| 35.0 | 62.637 | 0 |
| 35.0 | 62.843 | 0 |
| 35.0 | 63.049 | 0 |
| 35.0 | 63.254 | 50 |
| 35.0 | 63.459 | 50 |
| 35.0 | 63.662 | 50 |
| 35.0 | 63.865 | 50 |
| 35.0 | 64.068 | 50 |
| 35.0 | 64.27 | 0 |
| 35.0 | 64.471 | 0 |
| 35.0 | 64.671 | 0 |
| 35.0 | 64.871 | 0 |
| 35.0 | 65.07 | 0 |
| 35.0 | 65.269 | 0 |
| 35.0 | 65.467 | 0 |
| 35.0 | 65.664 | 0 |
| 35.0 | 65.86 | 0 |
| 35.0 | 66.056 | 50 |
| 35.0 | 66.25 | 50 |
| 35.0 | 66.445 | 50 |
| 35.0 | 66.638 | 50 |
| 36.0 | 66.831 | 50 |
| 36.0 | 67.023 | 0 |
| 36.0 | 67.214 | 0 |
| 36.0 | 67.405 | 0 |
| 36.0 | 67.594 | 0 |
| 36.0 | 67.783 | 0 |
| 36.0 | 67.971 | 0 |
| 36.0 | 68.159 | 0 |
| 36.0 | 68.346 | 50 |
| 36.0 | 68.531 | 50 |
| 36.0 | 68.717 | 50 |
| 36.0 | 68.901 | 50 |
| 36.0 | 69.084 | 50 |
| 36.0 | 69.267 | 0 |
| 36.0 | 69.449 | 0 |
| 36.0 | 69.63 | 0 |
| 36.0 | 69.81 | 0 |
| 36.0 | 69.99 | 0 |
| 36.0 | 70.168 | 0 |
| 36.0 | 70.346 | 50 |
| 36.0 | 70.523 | 50 |
| 36.0 | 70.699 | 50 |
| 36.0 | 70.874 | 50 |
| 36.0 | 71.048 | 50 |
| 36.0 | 71.222 | 0 |
| 36.0 | 71.394 | 0 |
| 36.0 | 71.566 | 0 |
| 36.0 | 71.737 | 0 |
| 36.0 | 71.907 | 0 |
| 36.0 | 72.076 | 0 |
| 36.0 | 72.244 | 50 |
| 36.0 | 72.412 | 50 |
| 36.0 | 72.578 | 50 |
| 36.0 | 72.744 | 50 |
| 36.0 | 72.908 | 50 |
| 36.0 | 73.072 | 0 |
| 36.0 | 73.235 | 0 |
| 36.0 | 73.397 | 0 |
| 36.0 | 73.558 | 0 |
| 36.0 | 73.718 | 0 |
| 36.0 | 73.877 | 50 |
| 36.0 | 74.035 | 50 |
| 36.0 | 74.192 | 50 |
| 36.0 | 74.348 | 50 |
| 36.0 | 74.503 | 50 |
| 36.0 | 74.658 | 0 |
| 36.0 | 74.811 | 0 |
| 36.0 | 74.963 | 0 |
| 36.0 | 75.115 | 0 |
| 36.0 | 75.265 | 50 |
| 36.0 | 75.415 | 50 |
| 36.0 | 75.563 | 50 |
| 36.0 | 75.711 | 50 |
| 36.0 | 75.857 | 50 |
| 36.0 | 76.003 | 0 |
| 36.0 | 76.147 | 0 |
| 36.0 | 76.291 | 0 |
| 36.0 | 76.433 | 50 |
| 36.0 | 76.575 | 50 |
| 36.0 | 76.715 | 50 |
| 37.0 | 76.855 | 50 |
| 37.0 | 76.993 | 50 |
| 37.0 | 77.131 | 0 |
| 37.0 | 77.267 | 0 |
| 37.0 | 77.403 | 0 |
| 37.0 | 77.537 | 50 |
| 37.0 | 77.67 | 50 |
| 37.0 | 77.803 | 50 |
| 37.0 | 77.934 | 50 |
| 37.0 | 78.064 | 50 |
| 37.0 | 78.193 | 0 |
| 37.0 | 78.321 | 0 |
| 37.0 | 78.448 | 50 |
| 37.0 | 78.574 | 50 |
| 37.0 | 78.699 | 50 |
| 37.0 | 78.823 | 50 |
| 37.0 | 78.946 | 50 |
| 37.0 | 79.067 | 0 |
| 37.0 | 79.188 | 0 |
| 37.0 | 79.308 | 50 |
| 37.0 | 79.426 | 50 |
| 37.0 | 79.544 | 50 |
| 37.0 | 79.66 | 50 |
| 37.0 | 79.775 | 50 |
| 37.0 | 79.889 | 0 |
| 37.0 | 80.002 | 0 |
| 37.0 | 80.114 | 50 |
| 37.0 | 80.225 | 100 |
| 37.0 | 80.335 | 100 |
| 37.0 | 80.443 | 100 |
| 37.0 | 80.551 | 100 |
| 37.0 | 80.657 | 100 |
| 37.0 | 80.763 | 100 |
| 37.0 | 80.867 | 100 |
| 37.0 | 80.97 | 100 |
| 37.0 | 81.072 | 100 |
| 37.0 | 81.173 | 100 |
| 37.0 | 81.272 | 100 |
| 37.0 | 81.371 | 100 |
| 37.0 | 81.468 | 100 |
| 37.0 | 81.565 | 100 |
| 37.0 | 81.66 | 100 |
| 37.0 | 81.754 | 100 |
| 37.0 | 81.847 | 100 |
| 37.0 | 81.939 | 100 |
| 37.0 | 82.03 | 100 |
| 37.0 | 82.119 | 100 |
| 37.0 | 82.207 | 100 |
| 37.0 | 82.295 | 100 |
| 37.0 | 82.381 | 100 |
| 37.0 | 82.466 | 100 |
| 37.0 | 82.55 | 100 |
| 37.0 | 82.632 | 100 |
| 37.0 | 82.714 | 100 |
| 37.0 | 82.794 | 100 |
| 37.0 | 82.873 | 100 |
| 37.0 | 82.951 | 100 |
| 37.0 | 83.028 | 100 |
| 37.0 | 83.104 | 100 |
| 37.0 | 83.179 | 100 |
| 38.0 | 83.252 | 100 |
| 38.0 | 83.324 | 100 |
| 38.0 | 83.395 | 100 |
| 38.0 | 83.465 | 100 |
| 38.0 | 83.534 | 100 |
| 38.0 | 83.602 | 100 |
| 38.0 | 83.668 | 100 |
| 38.0 | 83.733 | 100 |
| 38.0 | 83.798 | 100 |
| 38.0 | 83.86 | 100 |
| 38.0 | 83.922 | 100 |
| 38.0 | 83.983 | 100 |
| 38.0 | 84.042 | 100 |
| 38.0 | 84.101 | 100 |
| 38.0 | 84.158 | 100 |
| 38.0 | 84.214 | 100 |
| 38.0 | 84.268 | 100 |
| 38.0 | 84.322 | 100 |
| 38.0 | 84.374 | 100 |
| 38.0 | 84.426 | 100 |
| 38.0 | 84.476 | 100 |
| 38.0 | 84.524 | 100 |
| 38.0 | 84.572 | 100 |
| 38.0 | 84.619 | 100 |
| 38.0 | 84.664 | 100 |
| 38.0 | 84.708 | 100 |
| 38.0 | 84.751 | 100 |
| 38.0 | 84.793 | 100 |
| 38.0 | 84.834 | 100 |
| 38.0 | 84.873 | 100 |
| 38.0 | 84.912 | 100 |
| 38.0 | 84.949 | 100 |
| 38.0 | 84.985 | 100 |
| 38.0 | 85.019 | 100 |
| 38.0 | 85.053 | 100 |
| 38.0 | 85.086 | 100 |
| 38.0 | 85.117 | 100 |
| 38.0 | 85.147 | 100 |
| 38.0 | 85.176 | 100 |
| 38.0 | 85.204 | 100 |
| 38.0 | 85.23 | 100 |
| 38.0 | 85.256 | 100 |
| 38.0 | 85.28 | 100 |
| 38.0 | 85.303 | 100 |
| 38.0 | 85.325 | 100 |
| 38.0 | 85.346 | 100 |
| 38.0 | 85.365 | 100 |
| 38.0 | 85.384 | 100 |
| 38.0 | 85.401 | 100 |
| 38.0 | 85.417 | 100 |
| 38.0 | 85.432 | 100 |
| 38.0 | 85.446 | 100 |
| 38.0 | 85.458 | 100 |
| 38.0 | 85.47 | 100 |
| 38.0 | 85.48 | 100 |
| 38.0 | 85.489 | 100 |
| 38.0 | 85.497 | 100 |
| 38.0 | 85.504 | 100 |
| 38.0 | 85.51 | 100 |
| 38.0 | 85.514 | 100 |
| 39.0 | 85.518 | 100 |
| 39.0 | 85.52 | 100 |
| 39.0 | 85.521 | 100 |
| 39.0 | 85.521 | 100 |
| 39.0 | 85.52 | 100 |
| 39.0 | 85.517 | 100 |
| 39.0 | 85.514 | 100 |
| 39.0 | 85.509 | 100 |
| 39.0 | 85.503 | 100 |
| 39.0 | 85.496 | 100 |
| 39.0 | 85.488 | 100 |
| 39.0 | 85.479 | 100 |
| 39.0 | 85.469 | 100 |
| 39.0 | 85.458 | 100 |
| 39.0 | 85.445 | 100 |
| 39.0 | 85.431 | 100 |
| 39.0 | 85.417 | 100 |
| 39.0 | 85.401 | 100 |
| 39.0 | 85.384 | 100 |
| 39.0 | 85.365 | 100 |
| 39.0 | 85.346 | 100 |
| 39.0 | 85.326 | 100 |
| 39.0 | 85.304 | 100 |
| 39.0 | 85.282 | 100 |
| 39.0 | 85.258 | 100 |
| 39.0 | 85.233 | 100 |
| 39.0 | 85.207 | 100 |
| 39.0 | 85.18 | 100 |
| 39.0 | 85.152 | 100 |
| 39.0 | 85.123 | 100 |
| 39.0 | 85.093 | 100 |
| 39.0 | 85.062 | 100 |
| 39.0 | 85.029 | 100 |
| 39.0 | 84.996 | 100 |
| 39.0 | 84.961 | 100 |
| 39.0 | 84.925 | 100 |
| 39.0 | 84.889 | 100 |
| 39.0 | 84.851 | 100 |
| 39.0 | 84.812 | 100 |
| 39.0 | 84.772 | 100 |
| 39.0 | 84.731 | 100 |
| 39.0 | 84.689 | 100 |
| 39.0 | 84.646 | 100 |
| 39.0 | 84.602 | 100 |
| 39.0 | 84.557 | 100 |
| 39.0 | 84.511 | 100 |
| 39.0 | 84.463 | 100 |
| 39.0 | 84.415 | 100 |
| 39.0 | 84.366 | 100 |
| 39.0 | 84.315 | 100 |
| 39.0 | 84.264 | 100 |
| 39.0 | 84.212 | 100 |
| 39.0 | 84.158 | 100 |
| 39.0 | 84.104 | 100 |
| 39.0 | 84.048 | 100 |
| 39.0 | 83.992 | 100 |
| 39.0 | 83.934 | 100 |
| 39.0 | 83.876 | 100 |
| 39.0 | 83.816 | 100 |
| 39.0 | 83.756 | 100 |
| 40.0 | 83.694 | 100 |
| 40.0 | 83.632 | 100 |
| 40.0 | 83.569 | 100 |
| 40.0 | 83.504 | 100 |
| 40.0 | 83.439 | 100 |
| 40.0 | 83.372 | 100 |
| 40.0 | 83.305 | 100 |
| 40.0 | 83.237 | 100 |
| 40.0 | 83.168 | 100 |
| 40.0 | 83.097 | 100 |
| 40.0 | 83.026 | 100 |
| 40.0 | 82.954 | 100 |
| 40.0 | 82.881 | 100 |
| 40.0 | 82.807 | 100 |
| 40.0 | 82.732 | 100 |
| 40.0 | 82.656 | 100 |
| 40.0 | 82.58 | 100 |
| 40.0 | 82.502 | 100 |
| 40.0 | 82.423 | 100 |
| 40.0 | 82.344 | 100 |
| 40.0 | 82.263 | 100 |
| 40.0 | 82.182 | 100 |
| 40.0 | 82.1 | 100 |
| 40.0 | 82.017 | 100 |
| 40.0 | 81.933 | 100 |
| 40.0 | 81.848 | 100 |
| 40.0 | 81.762 | 100 |
| 40.0 | 81.676 | 100 |
| 40.0 | 81.588 | 100 |
| 40.0 | 81.5 | 100 |
| 40.0 | 81.41 | 100 |
| 40.0 | 81.32 | 100 |
| 40.0 | 81.229 | 100 |
| 40.0 | 81.138 | 100 |
| 40.0 | 81.045 | 100 |
| 40.0 | 80.951 | 100 |
| 40.0 | 80.857 | 100 |
| 40.0 | 80.762 | 100 |
| 40.0 | 80.666 | 100 |
| 40.0 | 80.569 | 100 |
| 40.0 | 80.472 | 100 |
| 40.0 | 80.373 | 100 |
| 40.0 | 80.274 | 100 |
| 40.0 | 80.174 | 100 |
| 40.0 | 80.073 | 100 |
| 40.0 | 79.972 | 100 |
| 40.0 | 79.869 | 100 |
| 40.0 | 79.766 | 100 |
| 40.0 | 79.662 | 100 |
| 40.0 | 79.558 | 100 |
| 40.0 | 79.452 | 100 |
| 40.0 | 79.346 | 100 |
| 40.0 | 79.239 | 100 |
| 40.0 | 79.131 | 100 |
| 40.0 | 79.023 | 100 |
| 40.0 | 78.914 | 100 |
| 40.0 | 78.804 | 100 |
| 40.0 | 78.693 | 100 |
| 40.0 | 78.582 | 100 |
| 40.0 | 78.47 | 100 |
| 41.0 | 78.357 | 100 |
| 41.0 | 78.244 | 100 |
| 41.0 | 78.13 | 100 |
| 41.0 | 78.015 | 100 |
| 41.0 | 77.9 | 100 |
| 41.0 | 77.783 | 100 |
| 41.0 | 77.666 | 100 |
| 41.0 | 77.549 | 100 |
| 41.0 | 77.431 | 100 |
| 41.0 | 77.312 | 100 |
| 41.0 | 77.193 | 100 |
| 41.0 | 77.072 | 100 |
| 41.0 | 76.952 | 100 |
| 41.0 | 76.83 | 100 |
| 41.0 | 76.708 | 100 |
| 41.0 | 76.586 | 100 |
| 41.0 | 76.462 | 100 |
| 41.0 | 76.339 | 100 |
| 41.0 | 76.214 | 100 |
| 41.0 | 76.089 | 100 |
| 41.0 | 75.963 | 100 |
| 41.0 | 75.837 | 100 |
| 41.0 | 75.71 | 100 |
| 41.0 | 75.583 | 100 |
| 41.0 | 75.455 | 100 |
| 41.0 | 75.327 | 100 |
| 41.0 | 75.198 | 100 |
| 41.0 | 75.068 | 100 |
| 41.0 | 74.938 | 100 |
| 41.0 | 74.807 | 100 |
| 41.0 | 74.676 | 100 |
| 41.0 | 74.544 | 100 |
| 41.0 | 74.412 | 100 |
| 41.0 | 74.279 | 100 |
| 41.0 | 74.146 | 100 |
| 41.0 | 74.012 | 100 |
| 41.0 | 73.878 | 100 |
| 41.0 | 73.743 | 100 |
| 41.0 | 73.608 | 100 |
| 41.0 | 73.473 | 100 |
| 41.0 | 73.336 | 100 |
| 41.0 | 73.2 | 100 |
| 41.0 | 73.063 | 100 |
| 41.0 | 72.925 | 100 |
| 41.0 | 72.787 | 100 |
| 41.0 | 72.649 | 100 |
| 41.0 | 72.51 | 100 |
| 41.0 | 72.371 | 100 |
| 41.0 | 72.231 | 100 |
| 41.0 | 72.091 | 100 |
| 41.0 | 71.951 | 100 |
| 41.0 | 71.81 | 100 |
| 41.0 | 71.669 | 100 |
| 41.0 | 71.527 | 100 |
| 41.0 | 71.385 | 100 |
| 41.0 | 71.243 | 100 |
| 41.0 | 71.1 | 100 |
| 41.0 | 70.957 | 100 |
| 41.0 | 70.814 | 100 |
| 41.0 | 70.67 | 100 |
| 42.0 | 70.526 | 100 |
| 42.0 | 70.382 | 100 |
| 42.0 | 70.237 | 100 |
| 42.0 | 70.092 | 100 |
| 42.0 | 69.946 | 100 |
| 42.0 | 69.801 | 50 |
| 42.0 | 69.655 | 50 |
| 42.0 | 69.508 | 50 |
| 42.0 | 69.362 | 50 |
| 42.0 | 69.215 | 50 |
| 42.0 | 69.068 | 0 |
| 42.0 | 68.921 | 0 |
| 42.0 | 68.773 | 0 |
| 42.0 | 68.625 | 0 |
| 42.0 | 68.477 | 0 |
| 42.0 | 68.329 | 0 |
| 42.0 | 68.18 | 0 |
| 42.0 | 68.031 | 50 |
| 42.0 | 67.882 | 50 |
| 42.0 | 67.733 | 50 |
| 42.0 | 67.584 | 50 |
| 42.0 | 67.434 | 50 |
| 42.0 | 67.284 | 0 |
| 42.0 | 67.134 | 0 |
| 42.0 | 66.984 | 0 |
| 42.0 | 66.834 | 0 |
| 42.0 | 66.683 | 0 |
| 42.0 | 66.533 | 0 |
| 42.0 | 66.382 | 0 |
| 42.0 | 66.231 | 0 |
| 42.0 | 66.08 | 50 |
| 42.0 | 65.929 | 50 |
| 42.0 | 65.777 | 50 |
| 42.0 | 65.626 | 50 |
| 42.0 | 65.474 | 50 |
| 42.0 | 65.323 | 0 |
| 42.0 | 65.171 | 0 |
| 42.0 | 65.019 | 0 |
| 42.0 | 64.867 | 0 |
| 42.0 | 64.715 | 0 |
| 42.0 | 64.563 | 0 |
| 42.0 | 64.411 | 0 |
| 42.0 | 64.259 | 0 |
| 42.0 | 64.107 | 0 |
| 42.0 | 63.954 | 50 |
| 42.0 | 63.802 | 50 |
| 42.0 | 63.65 | 50 |
| 42.0 | 63.497 | 50 |
| 42.0 | 63.345 | 50 |
| 42.0 | 63.193 | 0 |
| 42.0 | 63.04 | 0 |
| 42.0 | 62.888 | 0 |
| 42.0 | 62.736 | 0 |
| 42.0 | 62.583 | 0 |
| 42.0 | 62.431 | 0 |
| 42.0 | 62.279 | 0 |
| 42.0 | 62.127 | 0 |
| 42.0 | 61.974 | 0 |
| 42.0 | 61.822 | 0 |
| 42.0 | 61.67 | 0 |
| 43.0 | 61.518 | 50 |
| 43.0 | 61.366 | 50 |
| 43.0 | 61.214 | 50 |
| 43.0 | 61.063 | 50 |
| 43.0 | 60.911 | 50 |
| 43.0 | 60.759 | 0 |
| 43.0 | 60.608 | 0 |
| 43.0 | 60.456 | 0 |
| 43.0 | 60.305 | 0 |
| 43.0 | 60.154 | 0 |
| 43.0 | 60.003 | 0 |
| 43.0 | 59.852 | 0 |
| 43.0 | 59.702 | 0 |
| 43.0 | 59.551 | 0 |
| 43.0 | 59.401 | 0 |
| 43.0 | 59.25 | 0 |
| 43.0 | 59.1 | 0 |
| 43.0 | 58.95 | 50 |
| 43.0 | 58.801 | 50 |
| 43.0 | 58.651 | 50 |
| 43.0 | 58.502 | 50 |
| 43.0 | 58.353 | 50 |
| 43.0 | 58.204 | 0 |
| 43.0 | 58.055 | 0 |
| 43.0 | 57.907 | 0 |
| 43.0 | 57.759 | 0 |
| 43.0 | 57.611 | 0 |
| 43.0 | 57.463 | 0 |
| 43.0 | 57.315 | 0 |
| 43.0 | 57.168 | 0 |
| 43.0 | 57.021 | 0 |
| 43.0 | 56.875 | 0 |
| 43.0 | 56.728 | 0 |
| 43.0 | 56.582 | 0 |
| 43.0 | 56.436 | 0 |
| 43.0 | 56.291 | 50 |
| 43.0 | 56.145 | 50 |
| 43.0 | 56 | 50 |
| 43.0 | 55.856 | 50 |
| 43.0 | 55.711 | 50 |
| 43.0 | 55.567 | 0 |
| 43.0 | 55.424 | 0 |
| 43.0 | 55.28 | 0 |
| 43.0 | 55.137 | 0 |
| 43.0 | 54.995 | 0 |
| 43.0 | 54.852 | 0 |
| 43.0 | 54.71 | 0 |
| 43.0 | 54.569 | 0 |
| 43.0 | 54.428 | 0 |
| 43.0 | 54.287 | 0 |
| 43.0 | 54.147 | 0 |
| 43.0 | 54.006 | 0 |
| 43.0 | 53.867 | 0 |
| 43.0 | 53.728 | 0 |
| 43.0 | 53.589 | 0 |
| 43.0 | 53.45 | 50 |
| 43.0 | 53.312 | 50 |
| 43.0 | 53.175 | 50 |
| 43.0 | 53.038 | 50 |
| 43.0 | 52.901 | 50 |
| 44.0 | 52.765 | 0 |
| 44.0 | 52.629 | 0 |
| 44.0 | 52.494 | 0 |
| 44.0 | 52.359 | 0 |
| 44.0 | 52.224 | 0 |
| 44.0 | 52.09 | 0 |
| 44.0 | 51.957 | 0 |
| 44.0 | 51.824 | 0 |
| 44.0 | 51.692 | 0 |
| 44.0 | 51.56 | 0 |
| 44.0 | 51.428 | 0 |
| 44.0 | 51.297 | 0 |
| 44.0 | 51.167 | 0 |
| 44.0 | 51.037 | 0 |
| 44.0 | 50.907 | 0 |
| 44.0 | 50.779 | 0 |
| 44.0 | 50.65 | 50 |
| 44.0 | 50.522 | 50 |
| 44.0 | 50.395 | 50 |
| 44.0 | 50.268 | 50 |
| 44.0 | 50.142 | 50 |
| 44.0 | 50.017 | 0 |
| 44.0 | 49.892 | 0 |
| 44.0 | 49.767 | 0 |
| 44.0 | 49.643 | 0 |
| 44.0 | 49.52 | 0 |
| 44.0 | 49.397 | 0 |
| 44.0 | 49.275 | 0 |
| 44.0 | 49.154 | 0 |
| 44.0 | 49.033 | 0 |
| 44.0 | 48.912 | 0 |
| 44.0 | 48.793 | 0 |
| 44.0 | 48.674 | 0 |
| 44.0 | 48.555 | 0 |
| 44.0 | 48.437 | 0 |
| 44.0 | 48.32 | 0 |
| 44.0 | 48.204 | 0 |
| 44.0 | 48.088 | 0 |
| 44.0 | 47.973 | 50 |
| 44.0 | 47.858 | 50 |
| 44.0 | 47.744 | 50 |
| 44.0 | 47.631 | 50 |
| 44.0 | 47.518 | 50 |
| 44.0 | 47.406 | 0 |
| 44.0 | 47.295 | 0 |
| 44.0 | 47.184 | 0 |
| 44.0 | 47.074 | 0 |
| 44.0 | 46.965 | 0 |
| 44.0 | 46.857 | 0 |
| 44.0 | 46.749 | 0 |
| 44.0 | 46.642 | 0 |
| 44.0 | 46.535 | 0 |
| 44.0 | 46.43 | 0 |
| 44.0 | 46.325 | 0 |
| 44.0 | 46.221 | 0 |
| 44.0 | 46.117 | 0 |
| 44.0 | 46.014 | 0 |
| 44.0 | 45.912 | 0 |
| 44.0 | 45.811 | 0 |
| 44.0 | 45.71 | 0 |
| 45.0 | 45.611 | 0 |
| 45.0 | 45.512 | 0 |
| 45.0 | 45.413 | 50 |
| 45.0 | 45.316 | 50 |
| 45.0 | 45.219 | 50 |
| 45.0 | 45.123 | 50 |
| 45.0 | 45.028 | 50 |
| 45.0 | 44.933 | 0 |
| 45.0 | 44.839 | 0 |
| 45.0 | 44.747 | 0 |
| 45.0 | 44.654 | 0 |
| 45.0 | 44.563 | 0 |
| 45.0 | 44.473 | 0 |
| 45.0 | 44.383 | 0 |
| 45.0 | 44.294 | 0 |
| 45.0 | 44.206 | 0 |
| 45.0 | 44.118 | 0 |
| 45.0 | 44.032 | 0 |
| 45.0 | 43.946 | 0 |
| 45.0 | 43.861 | 0 |
| 45.0 | 43.777 | 0 |
| 45.0 | 43.694 | 0 |
| 45.0 | 43.612 | 0 |
| 45.0 | 43.53 | 0 |
| 45.0 | 43.45 | 0 |
| 45.0 | 43.37 | 0 |
| 45.0 | 43.291 | 0 |
| 45.0 | 43.213 | 50 |
| 45.0 | 43.135 | 50 |
| 45.0 | 43.059 | 50 |
| 45.0 | 42.983 | 50 |
| 45.0 | 42.908 | 50 |
| 45.0 | 42.834 | 0 |
| 45.0 | 42.761 | 0 |
| 45.0 | 42.689 | 0 |
| 45.0 | 42.618 | 0 |
| 45.0 | 42.548 | 0 |
| 45.0 | 42.478 | 0 |
| 45.0 | 42.409 | 0 |
| 45.0 | 42.342 | 0 |
| 45.0 | 42.275 | 0 |
| 45.0 | 42.209 | 0 |
| 45.0 | 42.144 | 0 |
| 45.0 | 42.079 | 0 |
| 45.0 | 42.016 | 0 |
| 45.0 | 41.954 | 0 |
| 45.0 | 41.892 | 0 |
| 45.0 | 41.832 | 0 |
| 45.0 | 41.772 | 0 |
| 45.0 | 41.713 | 0 |
| 45.0 | 41.655 | 0 |
| 45.0 | 41.598 | 0 |
| 45.0 | 41.542 | 0 |
| 45.0 | 41.487 | 50 |
| 45.0 | 41.433 | 50 |
| 45.0 | 41.38 | 50 |
| 45.0 | 41.327 | 50 |
| 45.0 | 41.276 | 50 |
| 45.0 | 41.225 | 0 |
| 45.0 | 41.176 | 0 |
| 46.0 | 41.127 | 0 |
| 46.0 | 41.08 | 0 |
| 46.0 | 41.033 | 0 |
| 46.0 | 40.987 | 0 |
| 46.0 | 40.942 | 0 |
| 46.0 | 40.898 | 0 |
| 46.0 | 40.855 | 0 |
| 46.0 | 40.813 | 0 |
| 46.0 | 40.772 | 0 |
| 46.0 | 40.732 | 0 |
| 46.0 | 40.693 | 0 |
| 46.0 | 40.654 | 0 |
| 46.0 | 40.617 | 0 |
| 46.0 | 40.581 | 0 |
| 46.0 | 40.545 | 0 |
| 46.0 | 40.511 | 0 |
| 46.0 | 40.477 | 0 |
| 46.0 | 40.445 | 0 |
| 46.0 | 40.413 | 0 |
| 46.0 | 40.383 | 50 |
| 46.0 | 40.353 | 50 |
| 46.0 | 40.324 | 50 |
| 46.0 | 40.297 | 50 |
| 46.0 | 40.27 | 50 |
| 46.0 | 40.244 | 0 |
| 46.0 | 40.219 | 0 |
| 46.0 | 40.196 | 0 |
| 46.0 | 40.173 | 0 |
| 46.0 | 40.151 | 0 |
| 46.0 | 40.13 | 0 |
| 46.0 | 40.11 | 0 |
| 46.0 | 40.091 | 0 |
| 46.0 | 40.073 | 0 |
| 46.0 | 40.056 | 0 |
| 46.0 | 40.04 | 0 |
| 46.0 | 40.025 | 0 |
| 46.0 | 40.011 | 0 |
| 46.0 | 39.998 | 0 |
| 46.0 | 39.986 | 0 |
| 46.0 | 39.974 | 0 |
| 46.0 | 39.964 | 0 |
| 46.0 | 39.955 | 0 |
| 46.0 | 39.947 | 0 |
| 46.0 | 39.94 | 0 |
| 46.0 | 39.933 | 0 |
| 46.0 | 39.928 | 0 |
| 46.0 | 39.924 | 50 |
| 46.0 | 39.92 | 50 |
| 46.0 | 39.918 | 50 |
| 46.0 | 39.917 | 50 |
| 46.0 | 39.916 | 50 |
| 46.0 | 39.917 | 0 |
| 46.0 | 39.918 | 0 |
| 46.0 | 39.921 | 0 |
| 46.0 | 39.924 | 0 |
| 46.0 | 39.929 | 0 |
| 46.0 | 39.934 | 0 |
| 46.0 | 39.941 | 0 |
| 46.0 | 39.948 | 0 |
| 46.0 | 39.957 | 0 |
| 47.0 | 39.966 | 0 |
| 47.0 | 39.976 | 0 |
| 47.0 | 39.988 | 0 |
| 47.0 | 40 | 0 |
| 47.0 | 40.013 | 0 |
| 47.0 | 40.027 | 0 |
| 47.0 | 40.043 | 0 |
| 47.0 | 40.059 | 0 |
| 47.0 | 40.076 | 0 |
| 47.0 | 40.094 | 0 |
| 47.0 | 40.113 | 0 |
| 47.0 | 40.133 | 0 |
| 47.0 | 40.154 | 50 |
| 47.0 | 40.176 | 50 |
| 47.0 | 40.199 | 50 |
| 47.0 | 40.223 | 50 |
| 47.0 | 40.248 | 50 |
| 47.0 | 40.274 | 0 |
| 47.0 | 40.301 | 0 |
| 47.0 | 40.328 | 0 |
| 47.0 | 40.357 | 0 |
| 47.0 | 40.387 | 0 |
| 47.0 | 40.417 | 0 |
| 47.0 | 40.449 | 0 |
| 47.0 | 40.481 | 0 |
| 47.0 | 40.515 | 0 |
| 47.0 | 40.549 | 0 |
| 47.0 | 40.585 | 0 |
| 47.0 | 40.621 | 0 |
| 47.0 | 40.658 | 0 |
| 47.0 | 40.696 | 0 |
| 47.0 | 40.735 | 0 |
| 47.0 | 40.776 | 0 |
| 47.0 | 40.816 | 0 |
| 47.0 | 40.858 | 0 |
| 47.0 | 40.901 | 0 |
| 47.0 | 40.945 | 0 |
| 47.0 | 40.99 | 0 |
| 47.0 | 41.035 | 50 |
| 47.0 | 41.082 | 50 |
| 47.0 | 41.129 | 50 |
| 47.0 | 41.178 | 50 |
| 47.0 | 41.227 | 50 |
| 47.0 | 41.277 | 0 |
| 47.0 | 41.328 | 0 |
| 47.0 | 41.38 | 0 |
| 47.0 | 41.433 | 0 |
| 47.0 | 41.487 | 0 |
| 47.0 | 41.542 | 0 |
| 47.0 | 41.598 | 0 |
| 47.0 | 41.654 | 0 |
| 47.0 | 41.712 | 0 |
| 47.0 | 41.77 | 0 |
| 47.0 | 41.829 | 0 |
| 47.0 | 41.889 | 0 |
| 47.0 | 41.95 | 0 |
| 47.0 | 42.012 | 0 |
| 47.0 | 42.075 | 0 |
| 47.0 | 42.139 | 0 |
| 47.0 | 42.203 | 0 |
| 48.0 | 42.268 | 0 |
| 48.0 | 42.335 | 0 |
| 48.0 | 42.402 | 0 |
| 48.0 | 42.47 | 50 |
| 48.0 | 42.539 | 50 |
| 48.0 | 42.608 | 50 |
| 48.0 | 42.679 | 50 |
| 48.0 | 42.75 | 50 |
| 48.0 | 42.822 | 0 |
| 48.0 | 42.895 | 0 |
| 48.0 | 42.969 | 0 |
| 48.0 | 43.044 | 0 |
| 48.0 | 43.119 | 0 |
| 48.0 | 43.196 | 0 |
| 48.0 | 43.273 | 0 |
| 48.0 | 43.351 | 0 |
| 48.0 | 43.43 | 0 |
| 48.0 | 43.51 | 0 |
| 48.0 | 43.59 | 0 |
| 48.0 | 43.671 | 0 |
| 48.0 | 43.753 | 0 |
| 48.0 | 43.836 | 0 |
| 48.0 | 43.92 | 0 |
| 48.0 | 44.004 | 0 |
| 48.0 | 44.09 | 0 |
| 48.0 | 44.176 | 0 |
| 48.0 | 44.262 | 0 |
| 48.0 | 44.35 | 50 |
| 48.0 | 44.438 | 50 |
| 48.0 | 44.527 | 50 |
| 48.0 | 44.617 | 50 |
| 48.0 | 44.708 | 50 |
| 48.0 | 44.799 | 0 |
| 48.0 | 44.891 | 0 |
| 48.0 | 44.984 | 0 |
| 48.0 | 45.078 | 0 |
| 48.0 | 45.172 | 0 |
| 48.0 | 45.267 | 0 |
| 48.0 | 45.363 | 0 |
| 48.0 | 45.46 | 0 |
| 48.0 | 45.557 | 0 |
| 48.0 | 45.655 | 0 |
| 48.0 | 45.754 | 0 |
| 48.0 | 45.853 | 0 |
| 48.0 | 45.953 | 0 |
| 48.0 | 46.054 | 0 |
| 48.0 | 46.156 | 0 |
| 48.0 | 46.258 | 0 |
| 48.0 | 46.361 | 0 |
| 48.0 | 46.465 | 0 |
| 48.0 | 46.569 | 50 |
| 48.0 | 46.674 | 50 |
| 48.0 | 46.779 | 50 |
| 48.0 | 46.886 | 50 |
| 48.0 | 46.993 | 50 |
| 48.0 | 47.1 | 0 |
| 48.0 | 47.208 | 0 |
| 48.0 | 47.317 | 0 |
| 48.0 | 47.427 | 0 |
| 48.0 | 47.537 | 0 |
| 49.0 | 47.648 | 0 |
| 49.0 | 47.759 | 0 |
| 49.0 | 47.871 | 0 |
| 49.0 | 47.984 | 0 |
| 49.0 | 48.097 | 0 |
| 49.0 | 48.211 | 0 |
| 49.0 | 48.325 | 0 |
| 49.0 | 48.44 | 0 |
| 49.0 | 48.556 | 0 |
| 49.0 | 48.672 | 0 |
| 49.0 | 48.789 | 0 |
| 49.0 | 48.906 | 0 |
| 49.0 | 49.024 | 50 |
| 49.0 | 49.143 | 50 |
| 49.0 | 49.262 | 50 |
| 49.0 | 49.381 | 50 |
| 49.0 | 49.501 | 50 |
| 49.0 | 49.622 | 0 |
| 49.0 | 49.743 | 0 |
| 49.0 | 49.865 | 0 |
| 49.0 | 49.987 | 0 |
| 49.0 | 50.11 | 0 |
| 49.0 | 50.233 | 0 |
| 49.0 | 50.357 | 0 |
| 49.0 | 50.482 | 0 |
| 49.0 | 50.606 | 0 |
| 49.0 | 50.732 | 0 |
| 49.0 | 50.857 | 0 |
| 49.0 | 50.984 | 0 |
| 49.0 | 51.11 | 0 |
| 49.0 | 51.238 | 0 |
| 49.0 | 51.365 | 0 |
| 49.0 | 51.493 | 0 |
| 49.0 | 51.622 | 50 |
| 49.0 | 51.751 | 50 |
| 49.0 | 51.88 | 50 |
| 49.0 | 52.01 | 50 |
| 49.0 | 52.141 | 50 |
| 49.0 | 52.271 | 0 |
| 49.0 | 52.403 | 0 |
| 49.0 | 52.534 | 0 |
| 49.0 | 52.666 | 0 |
| 49.0 | 52.799 | 0 |
| 49.0 | 52.931 | 0 |
| 49.0 | 53.065 | 0 |
| 49.0 | 53.198 | 0 |
| 49.0 | 53.332 | 0 |
| 49.0 | 53.466 | 0 |
| 49.0 | 53.601 | 0 |
| 49.0 | 53.736 | 0 |
| 49.0 | 53.871 | 0 |
| 49.0 | 54.007 | 0 |
| 49.0 | 54.143 | 50 |
| 49.0 | 54.279 | 50 |
| 49.0 | 54.416 | 50 |
| 49.0 | 54.553 | 50 |
| 49.0 | 54.69 | 50 |
| 49.0 | 54.828 | 0 |
| 49.0 | 54.966 | 0 |
| 49.0 | 55.104 | 0 |
| 50.0 | 55.243 | 0 |
| 50.0 | 55.381 | 0 |
| 50.0 | 55.521 | 0 |
| 50.0 | 55.66 | 0 |
| 50.0 | 55.8 | 0 |
| 50.0 | 55.939 | 0 |
| 50.0 | 56.08 | 0 |
| 50.0 | 56.22 | 0 |
| 50.0 | 56.36 | 0 |
| 50.0 | 56.501 | 0 |
| 50.0 | 56.642 | 50 |
| 50.0 | 56.784 | 50 |
| 50.0 | 56.925 | 50 |
| 50.0 | 57.067 | 50 |
| 50.0 | 57.209 | 50 |
| 50.0 | 57.351 | 0 |
| 50.0 | 57.493 | 0 |
| 50.0 | 57.636 | 0 |
| 50.0 | 57.778 | 0 |
| 50.0 | 57.921 | 0 |
| 50.0 | 58.064 | 0 |
| 50.0 | 58.207 | 0 |
| 50.0 | 58.35 | 0 |
| 50.0 | 58.494 | 0 |
| 50.0 | 58.637 | 0 |
| 50.0 | 58.781 | 0 |
| 50.0 | 58.925 | 0 |
| 50.0 | 59.069 | 50 |
| 50.0 | 59.213 | 50 |
| 50.0 | 59.357 | 50 |
| 50.0 | 59.501 | 50 |
| 50.0 | 59.645 | 50 |
| 50.0 | 59.79 | 0 |
| 50.0 | 59.934 | 0 |
| 50.0 | 60.079 | 0 |
| 50.0 | 60.223 | 0 |
| 50.0 | 60.368 | 0 |
| 50.0 | 60.513 | 0 |
| 50.0 | 60.657 | 0 |
| 50.0 | 60.802 | 0 |
| 50.0 | 60.947 | 0 |
| 50.0 | 61.092 | 0 |
| 50.0 | 61.237 | 0 |
| 50.0 | 61.381 | 50 |
| 50.0 | 61.526 | 50 |
| 50.0 | 61.671 | 50 |
| 50.0 | 61.816 | 50 |
| 50.0 | 61.961 | 50 |
| 50.0 | 62.106 | 0 |
| 50.0 | 62.25 | 0 |
| 50.0 | 62.395 | 0 |
| 50.0 | 62.54 | 0 |
| 50.0 | 62.684 | 0 |
| 50.0 | 62.829 | 0 |
| 50.0 | 62.973 | 0 |
| 50.0 | 63.118 | 0 |
| 50.0 | 63.262 | 0 |
| 50.0 | 63.407 | 0 |
| 50.0 | 63.551 | 50 |
| 50.0 | 63.695 | 50 |
| 51.0 | 63.839 | 50 |
| 51.0 | 63.983 | 50 |
| 51.0 | 64.126 | 50 |
| 51.0 | 64.27 | 0 |
| 51.0 | 64.414 | 0 |
| 51.0 | 64.557 | 0 |
| 51.0 | 64.7 | 0 |
| 51.0 | 64.843 | 0 |
| 51.0 | 64.986 | 0 |
| 51.0 | 65.129 | 0 |
| 51.0 | 65.271 | 0 |
| 51.0 | 65.414 | 0 |
| 51.0 | 65.556 | 50 |
| 51.0 | 65.698 | 50 |
| 51.0 | 65.84 | 50 |
| 51.0 | 65.982 | 50 |
| 51.0 | 66.123 | 50 |
| 51.0 | 66.264 | 0 |
| 51.0 | 66.405 | 0 |
| 51.0 | 66.546 | 0 |
| 51.0 | 66.686 | 0 |
| 51.0 | 66.827 | 0 |
| 51.0 | 66.967 | 0 |
| 51.0 | 67.106 | 0 |
| 51.0 | 67.246 | 0 |
| 51.0 | 67.385 | 50 |
| 51.0 | 67.524 | 50 |
| 51.0 | 67.663 | 50 |
| 51.0 | 67.801 | 50 |
| 51.0 | 67.939 | 50 |
| 51.0 | 68.077 | 0 |
| 51.0 | 68.214 | 0 |
| 51.0 | 68.351 | 0 |
| 51.0 | 68.488 | 0 |
| 51.0 | 68.625 | 0 |
| 51.0 | 68.761 | 0 |
| 51.0 | 68.897 | 0 |
| 51.0 | 69.032 | 50 |
| 51.0 | 69.167 | 50 |
| 51.0 | 69.302 | 50 |
| 51.0 | 69.436 | 50 |
| 51.0 | 69.57 | 50 |
| 51.0 | 69.704 | 0 |
| 51.0 | 69.837 | 0 |
| 51.0 | 69.97 | 0 |
| 51.0 | 70.103 | 0 |
| 51.0 | 70.235 | 0 |
| 51.0 | 70.366 | 0 |
| 51.0 | 70.497 | 50 |
| 51.0 | 70.628 | 50 |
| 51.0 | 70.759 | 50 |
| 51.0 | 70.888 | 50 |
| 51.0 | 71.018 | 50 |
| 51.0 | 71.147 | 0 |
| 51.0 | 71.275 | 0 |
| 51.0 | 71.404 | 0 |
| 51.0 | 71.531 | 0 |
| 51.0 | 71.658 | 0 |
| 51.0 | 71.785 | 0 |
| 51.0 | 71.911 | 50 |
| 52.0 | 72.037 | 50 |
| 52.0 | 72.162 | 50 |
| 52.0 | 72.287 | 50 |
| 52.0 | 72.411 | 50 |
| 52.0 | 72.534 | 0 |
| 52.0 | 72.657 | 0 |
| 52.0 | 72.78 | 0 |
| 52.0 | 72.902 | 0 |
| 52.0 | 73.024 | 0 |
| 52.0 | 73.145 | 50 |
| 52.0 | 73.265 | 50 |
| 52.0 | 73.385 | 50 |
| 52.0 | 73.504 | 50 |
| 52.0 | 73.623 | 50 |
| 52.0 | 73.741 | 0 |
| 52.0 | 73.858 | 0 |
| 52.0 | 73.975 | 0 |
| 52.0 | 74.092 | 0 |
| 52.0 | 74.207 | 50 |
| 52.0 | 74.322 | 50 |
| 52.0 | 74.437 | 50 |
| 52.0 | 74.551 | 50 |
| 52.0 | 74.664 | 50 |
| 52.0 | 74.777 | 0 |
| 52.0 | 74.889 | 0 |
| 52.0 | 75 | 0 |
| 52.0 | 75.111 | 0 |
| 52.0 | 75.221 | 50 |
| 52.0 | 75.33 | 50 |
| 52.0 | 75.439 | 50 |
| 52.0 | 75.547 | 50 |
| 52.0 | 75.654 | 50 |
| 52.0 | 75.761 | 0 |
| 52.0 | 75.867 | 0 |
| 52.0 | 75.972 | 0 |
| 52.0 | 76.077 | 0 |
| 52.0 | 76.181 | 50 |
| 52.0 | 76.284 | 50 |
| 52.0 | 76.386 | 50 |
| 52.0 | 76.488 | 50 |
| 52.0 | 76.589 | 50 |
| 52.0 | 76.689 | 0 |
| 52.0 | 76.789 | 0 |
| 52.0 | 76.888 | 0 |
| 52.0 | 76.986 | 50 |
| 52.0 | 77.083 | 50 |
| 52.0 | 77.18 | 50 |
| 52.0 | 77.275 | 50 |
| 52.0 | 77.37 | 50 |
| 52.0 | 77.465 | 0 |
| 52.0 | 77.558 | 0 |
| 52.0 | 77.651 | 0 |
| 52.0 | 77.743 | 50 |
| 52.0 | 77.834 | 50 |
| 52.0 | 77.924 | 50 |
| 52.0 | 78.014 | 50 |
| 52.0 | 78.102 | 50 |
| 52.0 | 78.19 | 0 |
| 52.0 | 78.277 | 0 |
| 52.0 | 78.363 | 50 |
| 53.0 | 78.449 | 50 |
| 53.0 | 78.533 | 50 |
| 53.0 | 78.617 | 50 |
| 53.0 | 78.7 | 50 |
| 53.0 | 78.782 | 0 |
| 53.0 | 78.863 | 0 |
| 53.0 | 78.944 | 50 |
| 53.0 | 79.023 | 50 |
| 53.0 | 79.102 | 50 |
| 53.0 | 79.179 | 50 |
| 53.0 | 79.256 | 50 |
| 53.0 | 79.332 | 0 |
| 53.0 | 79.407 | 0 |
| 53.0 | 79.482 | 50 |
| 53.0 | 79.555 | 50 |
| 53.0 | 79.627 | 50 |
| 53.0 | 79.699 | 50 |
| 53.0 | 79.77 | 50 |
| 53.0 | 79.839 | 0 |
| 53.0 | 79.908 | 0 |
| 53.0 | 79.976 | 50 |
| 53.0 | 80.043 | 50 |
| 53.0 | 80.109 | 100 |
| 53.0 | 80.174 | 100 |
| 53.0 | 80.238 | 100 |
| 53.0 | 80.301 | 100 |
| 53.0 | 80.364 | 100 |
| 53.0 | 80.425 | 100 |
| 53.0 | 80.485 | 100 |
| 53.0 | 80.545 | 100 |
| 53.0 | 80.603 | 100 |
| 53.0 | 80.661 | 100 |
| 53.0 | 80.717 | 100 |
| 53.0 | 80.773 | 100 |
| 53.0 | 80.828 | 100 |
| 53.0 | 80.881 | 100 |
| 53.0 | 80.934 | 100 |
| 53.0 | 80.985 | 100 |
| 53.0 | 81.036 | 100 |
| 53.0 | 81.086 | 100 |
| 53.0 | 81.135 | 100 |
| 53.0 | 81.182 | 100 |
| 53.0 | 81.229 | 100 |
| 53.0 | 81.275 | 100 |
| 53.0 | 81.319 | 100 |
| 53.0 | 81.363 | 100 |
| 53.0 | 81.406 | 100 |
| 53.0 | 81.447 | 100 |
| 53.0 | 81.488 | 100 |
| 53.0 | 81.527 | 100 |
| 53.0 | 81.566 | 100 |
| 53.0 | 81.604 | 100 |
| 53.0 | 81.64 | 100 |
| 53.0 | 81.676 | 100 |
| 53.0 | 81.71 | 100 |
| 53.0 | 81.743 | 100 |
| 53.0 | 81.776 | 100 |
| 53.0 | 81.807 | 100 |
| 53.0 | 81.837 | 100 |
| 53.0 | 81.866 | 100 |
| 54.0 | 81.894 | 100 |
| 54.0 | 81.922 | 100 |
| 54.0 | 81.948 | 100 |
| 54.0 | 81.972 | 100 |
| 54.0 | 81.996 | 100 |
| 54.0 | 82.019 | 100 |
| 54.0 | 82.041 | 100 |
| 54.0 | 82.062 | 100 |
| 54.0 | 82.081 | 100 |
| 54.0 | 82.1 | 100 |
| 54.0 | 82.117 | 100 |
| 54.0 | 82.133 | 100 |
| 54.0 | 82.149 | 100 |
| 54.0 | 82.163 | 100 |
| 54.0 | 82.176 | 100 |
| 54.0 | 82.188 | 100 |
| 54.0 | 82.199 | 100 |
| 54.0 | 82.208 | 100 |
| 54.0 | 82.217 | 100 |
| 54.0 | 82.225 | 100 |
| 54.0 | 82.231 | 100 |
| 54.0 | 82.236 | 100 |
| 54.0 | 82.241 | 100 |
| 54.0 | 82.244 | 100 |
| 54.0 | 82.246 | 100 |
| 54.0 | 82.247 | 100 |
| 54.0 | 82.247 | 100 |
| 54.0 | 82.245 | 100 |
| 54.0 | 82.243 | 100 |
| 54.0 | 82.239 | 100 |
| 54.0 | 82.235 | 100 |
| 54.0 | 82.229 | 100 |
| 54.0 | 82.222 | 100 |
| 54.0 | 82.214 | 100 |
| 54.0 | 82.205 | 100 |
| 54.0 | 82.195 | 100 |
| 54.0 | 82.183 | 100 |
| 54.0 | 82.171 | 100 |
| 54.0 | 82.157 | 100 |
| 54.0 | 82.142 | 100 |
| 54.0 | 82.126 | 100 |
| 54.0 | 82.109 | 100 |
| 54.0 | 82.091 | 100 |
| 54.0 | 82.072 | 100 |
| 54.0 | 82.051 | 100 |
| 54.0 | 82.03 | 100 |
| 54.0 | 82.007 | 100 |
| 54.0 | 81.983 | 100 |
| 54.0 | 81.958 | 100 |
| 54.0 | 81.932 | 100 |
| 54.0 | 81.904 | 100 |
| 54.0 | 81.876 | 100 |
| 54.0 | 81.846 | 100 |
| 54.0 | 81.816 | 100 |
| 54.0 | 81.784 | 100 |
| 54.0 | 81.751 | 100 |
| 54.0 | 81.716 | 100 |
| 54.0 | 81.681 | 100 |
| 54.0 | 81.645 | 100 |
| 54.0 | 81.607 | 100 |
| 55.0 | 81.568 | 100 |
| 55.0 | 81.528 | 100 |
| 55.0 | 81.487 | 100 |
| 55.0 | 81.445 | 100 |
| 55.0 | 81.402 | 100 |
| 55.0 | 81.357 | 100 |
| 55.0 | 81.311 | 100 |
| 55.0 | 81.265 | 100 |
| 55.0 | 81.217 | 100 |
| 55.0 | 81.168 | 100 |
| 55.0 | 81.117 | 100 |
| 55.0 | 81.066 | 100 |
| 55.0 | 81.013 | 100 |
| 55.0 | 80.96 | 100 |
| 55.0 | 80.905 | 100 |
| 55.0 | 80.849 | 100 |
| 55.0 | 80.792 | 100 |
| 55.0 | 80.733 | 100 |
| 55.0 | 80.674 | 100 |
| 55.0 | 80.613 | 100 |
| 55.0 | 80.552 | 100 |
| 55.0 | 80.489 | 100 |
| 55.0 | 80.425 | 100 |
| 55.0 | 80.36 | 100 |
| 55.0 | 80.294 | 100 |
| 55.0 | 80.226 | 100 |
| 55.0 | 80.158 | 100 |
| 55.0 | 80.088 | 100 |
| 55.0 | 80.017 | 100 |
| 55.0 | 79.945 | 100 |
| 55.0 | 79.872 | 100 |
| 55.0 | 79.798 | 100 |
| 55.0 | 79.722 | 100 |
| 55.0 | 79.646 | 100 |
| 55.0 | 79.568 | 100 |
| 55.0 | 79.49 | 100 |
| 55.0 | 79.41 | 100 |
| 55.0 | 79.329 | 100 |
| 55.0 | 79.247 | 100 |
| 55.0 | 79.163 | 100 |
| 55.0 | 79.079 | 100 |
| 55.0 | 78.993 | 100 |
| 55.0 | 78.907 | 100 |
| 55.0 | 78.819 | 100 |
| 55.0 | 78.73 | 100 |
| 55.0 | 78.64 | 100 |
| 55.0 | 78.549 | 100 |
| 55.0 | 78.457 | 100 |
| 55.0 | 78.364 | 100 |
| 55.0 | 78.269 | 100 |
| 55.0 | 78.174 | 100 |
| 55.0 | 78.077 | 100 |
| 55.0 | 77.98 | 100 |
| 55.0 | 77.881 | 100 |
| 55.0 | 77.781 | 100 |
| 55.0 | 77.68 | 100 |
| 55.0 | 77.578 | 100 |
| 55.0 | 77.475 | 100 |
| 55.0 | 77.37 | 100 |
| 55.0 | 77.265 | 100 |
| 56.0 | 77.159 | 100 |
| 56.0 | 77.051 | 100 |
| 56.0 | 76.943 | 100 |
| 56.0 | 76.833 | 100 |
| 56.0 | 76.722 | 100 |
| 56.0 | 76.61 | 100 |
| 56.0 | 76.497 | 100 |
| 56.0 | 76.383 | 100 |
| 56.0 | 76.268 | 100 |
| 56.0 | 76.152 | 100 |
| 56.0 | 76.035 | 100 |
| 56.0 | 75.917 | 100 |
| 56.0 | 75.798 | 100 |
| 56.0 | 75.678 | 100 |
| 56.0 | 75.556 | 100 |
| 56.0 | 75.434 | 100 |
| 56.0 | 75.31 | 100 |
| 56.0 | 75.186 | 100 |
| 56.0 | 75.06 | 100 |
| 56.0 | 74.934 | 100 |
| 56.0 | 74.806 | 100 |
| 56.0 | 74.678 | 100 |
| 56.0 | 74.548 | 100 |
| 56.0 | 74.418 | 100 |
| 56.0 | 74.286 | 100 |
| 56.0 | 74.153 | 100 |
| 56.0 | 74.02 | 100 |
| 56.0 | 73.885 | 100 |
| 56.0 | 73.749 | 100 |
| 56.0 | 73.613 | 100 |
| 56.0 | 73.475 | 100 |
| 56.0 | 73.336 | 100 |
| 56.0 | 73.197 | 100 |
| 56.0 | 73.056 | 100 |
| 56.0 | 72.914 | 100 |
| 56.0 | 72.772 | 100 |
| 56.0 | 72.628 | 100 |
| 56.0 | 72.484 | 100 |
| 56.0 | 72.338 | 100 |
| 56.0 | 72.192 | 100 |
| 56.0 | 72.044 | 100 |
| 56.0 | 71.896 | 100 |
| 56.0 | 71.747 | 100 |
| 56.0 | 71.596 | 100 |
| 56.0 | 71.445 | 100 |
| 56.0 | 71.293 | 100 |
| 56.0 | 71.14 | 100 |
| 56.0 | 70.986 | 100 |
| 56.0 | 70.831 | 100 |
| 56.0 | 70.675 | 100 |
| 56.0 | 70.518 | 100 |
| 56.0 | 70.361 | 100 |
| 56.0 | 70.202 | 100 |
| 56.0 | 70.042 | 100 |
| 56.0 | 69.882 | 100 |
| 56.0 | 69.721 | 50 |
| 56.0 | 69.559 | 50 |
| 56.0 | 69.395 | 50 |
| 56.0 | 69.232 | 50 |
| 56.0 | 69.067 | 50 |
| 57.0 | 68.901 | 0 |
| 57.0 | 68.734 | 0 |
| 57.0 | 68.567 | 0 |
| 57.0 | 68.399 | 0 |
| 57.0 | 68.229 | 0 |
| 57.0 | 68.059 | 0 |
| 57.0 | 67.889 | 0 |
| 57.0 | 67.717 | 0 |
| 57.0 | 67.544 | 50 |
| 57.0 | 67.371 | 50 |
| 57.0 | 67.197 | 50 |
| 57.0 | 67.022 | 50 |
| 57.0 | 66.846 | 50 |
| 57.0 | 66.669 | 0 |
| 57.0 | 66.492 | 0 |
| 57.0 | 66.314 | 0 |
| 57.0 | 66.135 | 0 |
| 57.0 | 65.955 | 0 |
| 57.0 | 65.774 | 0 |
| 57.0 | 65.593 | 0 |
| 57.0 | 65.411 | 0 |
| 57.0 | 65.228 | 0 |
| 57.0 | 65.044 | 50 |
| 57.0 | 64.86 | 50 |
| 57.0 | 64.675 | 50 |
| 57.0 | 64.489 | 50 |
| 57.0 | 64.302 | 50 |
| 57.0 | 64.115 | 0 |
| 57.0 | 63.927 | 0 |
| 57.0 | 63.738 | 0 |
| 57.0 | 63.548 | 0 |
| 57.0 | 63.358 | 0 |
| 57.0 | 63.167 | 0 |
| 57.0 | 62.975 | 0 |
| 57.0 | 62.783 | 0 |
| 57.0 | 62.59 | 0 |
| 57.0 | 62.396 | 0 |
| 57.0 | 62.201 | 50 |
| 57.0 | 62.006 | 50 |
| 57.0 | 61.81 | 50 |
| 57.0 | 61.614 | 50 |
| 57.0 | 61.417 | 50 |
| 57.0 | 61.219 | 0 |
| 57.0 | 61.021 | 0 |
| 57.0 | 60.822 | 0 |
| 57.0 | 60.622 | 0 |
| 57.0 | 60.422 | 0 |
| 57.0 | 60.221 | 0 |
| 57.0 | 60.019 | 0 |
| 57.0 | 59.817 | 0 |
| 57.0 | 59.614 | 0 |
| 57.0 | 59.411 | 0 |
| 57.0 | 59.207 | 0 |
| 57.0 | 59.002 | 0 |
| 57.0 | 58.797 | 50 |
| 57.0 | 58.592 | 50 |
| 57.0 | 58.385 | 50 |
| 57.0 | 58.179 | 50 |
| 57.0 | 57.971 | 50 |
| 57.0 | 57.763 | 0 |
| 58.0 | 57.555 | 0 |
| 58.0 | 57.346 | 0 |
| 58.0 | 57.136 | 0 |
| 58.0 | 56.926 | 0 |
| 58.0 | 56.716 | 0 |
| 58.0 | 56.505 | 0 |
| 58.0 | 56.293 | 0 |
| 58.0 | 56.081 | 0 |
| 58.0 | 55.869 | 0 |
| 58.0 | 55.656 | 0 |
| 58.0 | 55.442 | 0 |
| 58.0 | 55.228 | 0 |
| 58.0 | 55.014 | 0 |
| 58.0 | 54.799 | 50 |
| 58.0 | 54.584 | 50 |
| 58.0 | 54.368 | 50 |
| 58.0 | 54.152 | 50 |
| 58.0 | 53.935 | 50 |
| 58.0 | 53.718 | 0 |
| 58.0 | 53.501 | 0 |
| 58.0 | 53.283 | 0 |
| 58.0 | 53.065 | 0 |
| 58.0 | 52.846 | 0 |
| 58.0 | 52.627 | 0 |
| 58.0 | 52.408 | 0 |
| 58.0 | 52.188 | 0 |
| 58.0 | 51.968 | 0 |
| 58.0 | 51.747 | 0 |
| 58.0 | 51.526 | 0 |
| 58.0 | 51.305 | 0 |
| 58.0 | 51.083 | 0 |
| 58.0 | 50.861 | 0 |
| 58.0 | 50.639 | 0 |
| 58.0 | 50.417 | 0 |
| 58.0 | 50.194 | 50 |
| 58.0 | 49.971 | 50 |
| 58.0 | 49.747 | 50 |
| 58.0 | 49.523 | 50 |
| 58.0 | 49.299 | 50 |
| 58.0 | 49.075 | 0 |
| 58.0 | 48.85 | 0 |
| 58.0 | 48.626 | 0 |
| 58.0 | 48.401 | 0 |
| 58.0 | 48.175 | 0 |
| 58.0 | 47.95 | 0 |
| 58.0 | 47.724 | 0 |
| 58.0 | 47.498 | 0 |
| 58.0 | 47.271 | 0 |
| 58.0 | 47.045 | 0 |
| 58.0 | 46.818 | 0 |
| 58.0 | 46.591 | 0 |
| 58.0 | 46.364 | 0 |
| 58.0 | 46.137 | 0 |
| 58.0 | 45.91 | 0 |
| 58.0 | 45.682 | 0 |
| 58.0 | 45.454 | 0 |
| 58.0 | 45.226 | 0 |
| 58.0 | 44.998 | 0 |
| 58.0 | 44.77 | 50 |
| 58.0 | 44.541 | 50 |
| 59.0 | 44.313 | 50 |
| 59.0 | 44.084 | 50 |
| 59.0 | 43.856 | 50 |
| 59.0 | 43.627 | 0 |
| 59.0 | 43.398 | 0 |
| 59.0 | 43.169 | 0 |
| 59.0 | 42.94 | 0 |
| 59.0 | 42.711 | 0 |
| 59.0 | 42.481 | 0 |
| 59.0 | 42.252 | 0 |
| 59.0 | 42.023 | 0 |
| 59.0 | 41.793 | 0 |
| 59.0 | 41.564 | 0 |
| 59.0 | 41.334 | 0 |
| 59.0 | 41.105 | 0 |
| 59.0 | 40.875 | 0 |
| 59.0 | 40.646 | 0 |
| 59.0 | 40.416 | 0 |
| 59.0 | 40.187 | 0 |
| 59.0 | 39.957 | 0 |
| 59.0 | 39.728 | 0 |
| 59.0 | 39.498 | 0 |
| 59.0 | 39.269 | 0 |
| 59.0 | 39.04 | 0 |
| 59.0 | 38.81 | 0 |
| 59.0 | 38.581 | 50 |
| 59.0 | 38.352 | 50 |
| 59.0 | 38.123 | 50 |
| 59.0 | 37.893 | 50 |
| 59.0 | 37.664 | 50 |
| 59.0 | 37.436 | 0 |
| 59.0 | 37.207 | 0 |
| 59.0 | 36.978 | 0 |
| 59.0 | 36.75 | 0 |
| 59.0 | 36.521 | 0 |
| 59.0 | 36.293 | 0 |
| 59.0 | 36.065 | 0 |
| 59.0 | 35.837 | 0 |
| 59.0 | 35.609 | 0 |
| 59.0 | 35.381 | 0 |
| 59.0 | 35.153 | 0 |
| 59.0 | 34.926 | 0 |
| 59.0 | 34.699 | 0 |
| 59.0 | 34.472 | 0 |
| 59.0 | 34.245 | 0 |
| 59.0 | 34.018 | 0 |
| 59.0 | 33.792 | 0 |
| 59.0 | 33.566 | 0 |
| 59.0 | 33.34 | 0 |
| 59.0 | 33.114 | 0 |
| 59.0 | 32.889 | 0 |
| 59.0 | 32.663 | 0 |
| 59.0 | 32.439 | 0 |
| 59.0 | 32.214 | 0 |
| 59.0 | 31.989 | 0 |
| 59.0 | 31.765 | 0 |
| 59.0 | 31.541 | 50 |
| 59.0 | 31.318 | 50 |
| 59.0 | 31.094 | 50 |
| 59.0 | 30.871 | 50 |
| 60.0 | 30.649 | 50 |